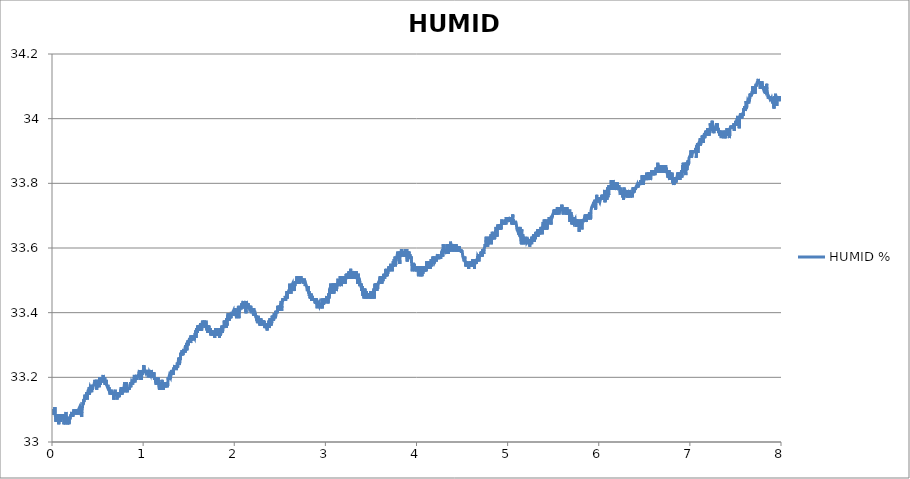
| Category | HUMID % |
|---|---|
| 0.0009014404444444445 | 33.085 |
| 0.003960782083333334 | 33.101 |
| 0.007023179472222222 | 33.085 |
| 0.010082798916666667 | 33.085 |
| 0.013142973944444445 | 33.093 |
| 0.01620231561111111 | 33.101 |
| 0.019261657249999998 | 33.085 |
| 0.0223215545 | 33.101 |
| 0.02538089613888889 | 33.101 |
| 0.028439959999999997 | 33.085 |
| 0.03149930166666667 | 33.108 |
| 0.034559754472222225 | 33.085 |
| 0.037619373916666664 | 33.078 |
| 0.04067871558333333 | 33.085 |
| 0.043738057222222224 | 33.062 |
| 0.04679739888888889 | 33.078 |
| 0.04985701833333333 | 33.085 |
| 0.05291635997222222 | 33.085 |
| 0.05597597941666666 | 33.085 |
| 0.059035598861111115 | 33.078 |
| 0.06209466272222222 | 33.085 |
| 0.06515567113888888 | 33.078 |
| 0.06821584616666666 | 33.078 |
| 0.07127518780555556 | 33.085 |
| 0.07433480725 | 33.055 |
| 0.07739414891666667 | 33.085 |
| 0.08045321277777778 | 33.07 |
| 0.08351311 | 33.062 |
| 0.0865721738611111 | 33.07 |
| 0.08963151552777779 | 33.085 |
| 0.09269085716666665 | 33.078 |
| 0.09575158777777777 | 33.062 |
| 0.09881092944444443 | 33.085 |
| 0.10187082666666668 | 33.07 |
| 0.10492989052777778 | 33.078 |
| 0.10798923219444444 | 33.078 |
| 0.11104829602777777 | 33.078 |
| 0.11410763769444444 | 33.085 |
| 0.11716697933333332 | 33.078 |
| 0.12022604319444445 | 33.085 |
| 0.12328566263888889 | 33.078 |
| 0.12634500430555556 | 33.078 |
| 0.12940406816666666 | 33.085 |
| 0.132463132 | 33.055 |
| 0.13552330705555557 | 33.078 |
| 0.1385829265 | 33.078 |
| 0.1416422681388889 | 33.07 |
| 0.14470188758333333 | 33.062 |
| 0.14776122922222223 | 33.055 |
| 0.1508205708888889 | 33.078 |
| 0.15388019033333333 | 33.093 |
| 0.15693925419444443 | 33.07 |
| 0.15999859583333334 | 33.07 |
| 0.1630579375 | 33.078 |
| 0.16611700133333332 | 33.078 |
| 0.169176343 | 33.055 |
| 0.1722356846388889 | 33.062 |
| 0.17529530408333333 | 33.07 |
| 0.17835520133333335 | 33.062 |
| 0.18141454297222223 | 33.07 |
| 0.18447360683333333 | 33.062 |
| 0.1875368376111111 | 33.055 |
| 0.1905967348333333 | 33.078 |
| 0.19365718766666667 | 33.078 |
| 0.1967176405 | 33.07 |
| 0.1997792045 | 33.078 |
| 0.20284049069444443 | 33.078 |
| 0.2059014991111111 | 33.078 |
| 0.20896084075000002 | 33.085 |
| 0.21202101580555555 | 33.078 |
| 0.21508202419444444 | 33.093 |
| 0.21814247702777778 | 33.085 |
| 0.22120209647222222 | 33.078 |
| 0.22426393827777777 | 33.093 |
| 0.2273235577222222 | 33.078 |
| 0.23038428833333333 | 33.078 |
| 0.2334444633611111 | 33.078 |
| 0.23650630516666665 | 33.093 |
| 0.2395675913611111 | 33.101 |
| 0.24262915536111113 | 33.085 |
| 0.24568877480555557 | 33.093 |
| 0.24874811647222222 | 33.093 |
| 0.2518074581111111 | 33.101 |
| 0.25486791094444444 | 33.101 |
| 0.2579280859722222 | 33.085 |
| 0.2609913167222222 | 33.085 |
| 0.2640520473611111 | 33.093 |
| 0.26711722266666665 | 33.101 |
| 0.2701776755 | 33.093 |
| 0.2732603518055556 | 33.101 |
| 0.2763194156666667 | 33.085 |
| 0.2793798685 | 33.101 |
| 0.2824392101388889 | 33.101 |
| 0.28549882958333334 | 33.093 |
| 0.28855817125 | 33.085 |
| 0.29161751288888893 | 33.101 |
| 0.29467685455555553 | 33.101 |
| 0.29773619619444447 | 33.101 |
| 0.30079553786111113 | 33.101 |
| 0.30385515730555557 | 33.108 |
| 0.30691449894444445 | 33.101 |
| 0.3099752295555555 | 33.101 |
| 0.313034849 | 33.085 |
| 0.31609419066666666 | 33.093 |
| 0.31915325452777776 | 33.085 |
| 0.32221315175 | 33.085 |
| 0.32527582694444446 | 33.078 |
| 0.3283354463888889 | 33.093 |
| 0.3313945102222222 | 33.093 |
| 0.3344538518888889 | 33.108 |
| 0.33751486030555555 | 33.108 |
| 0.34057447975000005 | 33.124 |
| 0.34363382138888887 | 33.116 |
| 0.3466942742222222 | 33.131 |
| 0.3497558382222222 | 33.124 |
| 0.3528149020833333 | 33.131 |
| 0.3558742437222222 | 33.131 |
| 0.3589335853888889 | 33.139 |
| 0.3619934826111111 | 33.146 |
| 0.3650531020555556 | 33.131 |
| 0.3681121659166666 | 33.131 |
| 0.3711720631666667 | 33.139 |
| 0.37423612730555555 | 33.139 |
| 0.37729519116666665 | 33.146 |
| 0.38035508838888893 | 33.154 |
| 0.3834147078333333 | 33.146 |
| 0.38647488286111115 | 33.131 |
| 0.38953478011111115 | 33.146 |
| 0.39259439955555553 | 33.154 |
| 0.39565374119444446 | 33.154 |
| 0.3987130828611111 | 33.162 |
| 0.4017721467222222 | 33.154 |
| 0.4048314883611111 | 33.162 |
| 0.40789110780555554 | 33.169 |
| 0.4109504494722222 | 33.146 |
| 0.4140103466944445 | 33.154 |
| 0.4170694105555555 | 33.162 |
| 0.42012875222222223 | 33.169 |
| 0.4231883716666667 | 33.169 |
| 0.42624771330555555 | 33.169 |
| 0.4293081661388889 | 33.169 |
| 0.43236778558333333 | 33.162 |
| 0.43542740502777777 | 33.154 |
| 0.43848730225 | 33.169 |
| 0.4415466439166667 | 33.177 |
| 0.4446059855555556 | 33.162 |
| 0.44766532722222224 | 33.169 |
| 0.4507246688611111 | 33.169 |
| 0.4537840105 | 33.169 |
| 0.4568433521666667 | 33.169 |
| 0.45990324941666666 | 33.177 |
| 0.46296231325000003 | 33.177 |
| 0.46602304388888893 | 33.177 |
| 0.46908544124999996 | 33.177 |
| 0.47214506069444445 | 33.192 |
| 0.4752069025 | 33.192 |
| 0.47826652194444447 | 33.177 |
| 0.48132641919444447 | 33.185 |
| 0.48438576083333335 | 33.192 |
| 0.4874503805555555 | 33.169 |
| 0.4905097222222222 | 33.162 |
| 0.49357323077777776 | 33.185 |
| 0.49663423919444444 | 33.169 |
| 0.4996944142222222 | 33.185 |
| 0.5027543114444445 | 33.185 |
| 0.5058358766111111 | 33.177 |
| 0.50889994075 | 33.192 |
| 0.5119620603333334 | 33.192 |
| 0.5150222353611111 | 33.185 |
| 0.518081577 | 33.169 |
| 0.5211445299722222 | 33.2 |
| 0.5242149833888889 | 33.185 |
| 0.5272784919444444 | 33.185 |
| 0.5303408893055556 | 33.177 |
| 0.53340050875 | 33.177 |
| 0.5364606838055556 | 33.192 |
| 0.5395200254444444 | 33.185 |
| 0.5425793670833333 | 33.192 |
| 0.5456384309444444 | 33.192 |
| 0.5486983281944444 | 33.2 |
| 0.5517590588055555 | 33.2 |
| 0.5548203450277778 | 33.185 |
| 0.5578799644722222 | 33.2 |
| 0.5609398616944444 | 33.207 |
| 0.56400337025 | 33.192 |
| 0.5670652120555556 | 33.192 |
| 0.5701248315 | 33.185 |
| 0.5731861176944445 | 33.185 |
| 0.5762535153611111 | 33.192 |
| 0.579318412888889 | 33.2 |
| 0.5823780323333334 | 33.177 |
| 0.5854382073611112 | 33.185 |
| 0.5884981046111111 | 33.185 |
| 0.5915630021388889 | 33.177 |
| 0.5946242883333334 | 33.192 |
| 0.5976839077777778 | 33.177 |
| 0.6007438050277777 | 33.177 |
| 0.6038053690277777 | 33.177 |
| 0.6068669330277777 | 33.177 |
| 0.6099287748055556 | 33.169 |
| 0.6129889498611111 | 33.177 |
| 0.6160510694444444 | 33.169 |
| 0.6191159669722222 | 33.162 |
| 0.6221755864166667 | 33.162 |
| 0.62523465025 | 33.169 |
| 0.6282978810277777 | 33.169 |
| 0.6313580560555556 | 33.154 |
| 0.6344176755 | 33.154 |
| 0.6374772949444445 | 33.146 |
| 0.6405388589444444 | 33.146 |
| 0.6435987561944445 | 33.154 |
| 0.6466630981111111 | 33.162 |
| 0.6497257733055556 | 33.162 |
| 0.652786226111111 | 33.162 |
| 0.6558483457222222 | 33.154 |
| 0.6589090763333334 | 33.146 |
| 0.6619686957777777 | 33.146 |
| 0.6650305375555556 | 33.146 |
| 0.6680926571666667 | 33.154 |
| 0.671153943361111 | 33.146 |
| 0.6742143961944443 | 33.154 |
| 0.6772748490277777 | 33.131 |
| 0.6803408577222222 | 33.146 |
| 0.6834035328888889 | 33.146 |
| 0.6864650968888889 | 33.146 |
| 0.6895272164722223 | 33.146 |
| 0.6925868359166667 | 33.162 |
| 0.69564728875 | 33.154 |
| 0.698708019361111 | 33.146 |
| 0.7017695833611111 | 33.146 |
| 0.7048294806111112 | 33.146 |
| 0.70788882225 | 33.146 |
| 0.7109506640555556 | 33.146 |
| 0.7140100056944444 | 33.131 |
| 0.7170693473611112 | 33.146 |
| 0.7201292445833334 | 33.154 |
| 0.7231891418333333 | 33.139 |
| 0.7262487612777777 | 33.146 |
| 0.7293081029166667 | 33.139 |
| 0.7323674445833334 | 33.146 |
| 0.735427619611111 | 33.154 |
| 0.7384872390555556 | 33.139 |
| 0.7415490808333334 | 33.154 |
| 0.7446092558888889 | 33.154 |
| 0.7476683197222223 | 33.146 |
| 0.7507276613888889 | 33.154 |
| 0.7537872808333334 | 33.162 |
| 0.7568477336666667 | 33.154 |
| 0.7599104088333334 | 33.169 |
| 0.7629725284166666 | 33.154 |
| 0.7660352035833333 | 33.162 |
| 0.7690948230277778 | 33.146 |
| 0.7721549980833333 | 33.169 |
| 0.77521767325 | 33.154 |
| 0.778278403861111 | 33.162 |
| 0.7813383011111111 | 33.154 |
| 0.7843979205555556 | 33.154 |
| 0.7874619846944444 | 33.162 |
| 0.7905229931111112 | 33.169 |
| 0.79358233475 | 33.169 |
| 0.796642232 | 33.185 |
| 0.7997015736388889 | 33.162 |
| 0.80276230425 | 33.154 |
| 0.8058224793055556 | 33.154 |
| 0.8088851544722223 | 33.154 |
| 0.8119500519999999 | 33.162 |
| 0.8150093936388888 | 33.162 |
| 0.8180726244166667 | 33.185 |
| 0.8211352995833334 | 33.162 |
| 0.8241960301944444 | 33.169 |
| 0.8272562052222222 | 33.154 |
| 0.8303169358611111 | 33.162 |
| 0.8333787776388889 | 33.162 |
| 0.8364389526666667 | 33.169 |
| 0.8395002388888889 | 33.162 |
| 0.8425623584722222 | 33.162 |
| 0.845629478361111 | 33.169 |
| 0.8486899311666667 | 33.162 |
| 0.8517506618055556 | 33.169 |
| 0.8548116701944445 | 33.169 |
| 0.8578721230277777 | 33.169 |
| 0.8609361871666668 | 33.185 |
| 0.8639971955833333 | 33.169 |
| 0.8670573706111111 | 33.185 |
| 0.8701172678611111 | 33.177 |
| 0.8731793874444445 | 33.185 |
| 0.8762426182222223 | 33.185 |
| 0.8793025154444445 | 33.185 |
| 0.8823621348888889 | 33.185 |
| 0.8854234211111112 | 33.177 |
| 0.8884847073055555 | 33.192 |
| 0.8915448823333333 | 33.185 |
| 0.8946086686944444 | 33.192 |
| 0.8976716216666667 | 33.185 |
| 0.9007323522777777 | 33.2 |
| 0.903792805111111 | 33.207 |
| 0.9068554802777777 | 33.2 |
| 0.9099159331111111 | 33.185 |
| 0.9129813862222221 | 33.192 |
| 0.9160410056666667 | 33.2 |
| 0.9191053475833333 | 33.2 |
| 0.9221644114444444 | 33.2 |
| 0.9252254198611112 | 33.207 |
| 0.9282875394444444 | 33.207 |
| 0.9313468811111111 | 33.192 |
| 0.93440622275 | 33.2 |
| 0.9374661200000001 | 33.207 |
| 0.9405329620833334 | 33.207 |
| 0.9435923037222222 | 33.207 |
| 0.9466519231666666 | 33.2 |
| 0.9497129315833334 | 33.207 |
| 0.9527725510277778 | 33.215 |
| 0.9558330038611111 | 33.215 |
| 0.9588931788888889 | 33.223 |
| 0.9619536317222223 | 33.207 |
| 0.9650154734999999 | 33.207 |
| 0.9680750929444445 | 33.215 |
| 0.971134434611111 | 33.207 |
| 0.9741976653611111 | 33.192 |
| 0.9772586737777778 | 33.207 |
| 0.9803205155555555 | 33.192 |
| 0.9833823573611111 | 33.2 |
| 0.9864422546111111 | 33.215 |
| 0.989503818611111 | 33.207 |
| 0.9925651048055555 | 33.223 |
| 0.9956258354166666 | 33.215 |
| 0.9986851770833333 | 33.215 |
| 1.0017445187222223 | 33.223 |
| 1.0048041381666666 | 33.215 |
| 1.0078690356944444 | 33.238 |
| 1.0109311552777778 | 33.215 |
| 1.013991608111111 | 33.223 |
| 1.0170551166666666 | 33.223 |
| 1.0201155695 | 33.223 |
| 1.0231749111388888 | 33.223 |
| 1.0262353639722221 | 33.215 |
| 1.0292988725277779 | 33.223 |
| 1.0323601587222222 | 33.223 |
| 1.0354211671388889 | 33.215 |
| 1.038480231 | 33.223 |
| 1.0415395726666667 | 33.215 |
| 1.0446022478333334 | 33.223 |
| 1.0476668675555556 | 33.215 |
| 1.0507292649444444 | 33.207 |
| 1.0537894399722223 | 33.215 |
| 1.0568543375000001 | 33.223 |
| 1.0599150681111111 | 33.223 |
| 1.062986354888889 | 33.2 |
| 1.066047918888889 | 33.2 |
| 1.0691089273055554 | 33.215 |
| 1.07216854675 | 33.215 |
| 1.07523011075 | 33.215 |
| 1.0782894524166666 | 33.215 |
| 1.0813526831666667 | 33.207 |
| 1.0844161917222221 | 33.215 |
| 1.08747636675 | 33.215 |
| 1.090536264 | 33.223 |
| 1.093597828 | 33.215 |
| 1.0966588364166667 | 33.215 |
| 1.0997215115833332 | 33.215 |
| 1.1027819644166665 | 33.2 |
| 1.1058454729722222 | 33.2 |
| 1.1089062035833332 | 33.215 |
| 1.111968045388889 | 33.207 |
| 1.1150346096666668 | 33.2 |
| 1.1180945068888888 | 33.215 |
| 1.12115357075 | 33.2 |
| 1.1242181905 | 33.192 |
| 1.127277532138889 | 33.192 |
| 1.1303385405555555 | 33.192 |
| 1.1334020491111112 | 33.2 |
| 1.13646139075 | 33.185 |
| 1.1395285106388888 | 33.185 |
| 1.1425897968333334 | 33.177 |
| 1.1456519164166667 | 33.177 |
| 1.148711535861111 | 33.185 |
| 1.1517733776666668 | 33.192 |
| 1.1548354972500001 | 33.185 |
| 1.1578948389166668 | 33.185 |
| 1.160954458361111 | 33.185 |
| 1.1640140778055554 | 33.2 |
| 1.1670767529722221 | 33.2 |
| 1.1701363724166665 | 33.185 |
| 1.1731987698055557 | 33.169 |
| 1.1762589448333334 | 33.169 |
| 1.1793213422222222 | 33.162 |
| 1.1823812394444444 | 33.177 |
| 1.1854436368333334 | 33.169 |
| 1.1885040896666668 | 33.169 |
| 1.1915650980555557 | 33.162 |
| 1.1946291622222223 | 33.185 |
| 1.197691004 | 33.162 |
| 1.2007536791666666 | 33.177 |
| 1.2038191322777778 | 33.169 |
| 1.2068795851111112 | 33.192 |
| 1.2099419825 | 33.185 |
| 1.2130027131111112 | 33.162 |
| 1.2160642771111112 | 33.185 |
| 1.2191252855277779 | 33.169 |
| 1.2221901830555557 | 33.162 |
| 1.2252498025 | 33.162 |
| 1.2283138666388889 | 33.177 |
| 1.2313765418055556 | 33.185 |
| 1.2344406059722224 | 33.177 |
| 1.2375168930277778 | 33.169 |
| 1.240577623638889 | 33.177 |
| 1.2436372430833333 | 33.177 |
| 1.2466979737222221 | 33.185 |
| 1.2497628712222222 | 33.185 |
| 1.2528236018611112 | 33.169 |
| 1.2559004445 | 33.185 |
| 1.2589622863055554 | 33.185 |
| 1.2620213501666666 | 33.185 |
| 1.265085969888889 | 33.177 |
| 1.2681458671388888 | 33.169 |
| 1.271207431138889 | 33.185 |
| 1.2742951077222222 | 33.2 |
| 1.2773569495277777 | 33.192 |
| 1.28041684675 | 33.192 |
| 1.283477577388889 | 33.2 |
| 1.2865380301944445 | 33.2 |
| 1.2895995942222223 | 33.207 |
| 1.292662824972222 | 33.207 |
| 1.2957221666111112 | 33.207 |
| 1.2987826194444445 | 33.207 |
| 1.3018480725555555 | 33.2 |
| 1.304907692 | 33.2 |
| 1.3079703671666667 | 33.2 |
| 1.3110294310277777 | 33.215 |
| 1.3140896060555556 | 33.223 |
| 1.3171525590277777 | 33.207 |
| 1.3202119006944446 | 33.223 |
| 1.3232717979166666 | 33.215 |
| 1.32633225075 | 33.223 |
| 1.3293927035833333 | 33.207 |
| 1.3324534341944445 | 33.215 |
| 1.3355133314444445 | 33.23 |
| 1.3385751732222222 | 33.223 |
| 1.3416347926666667 | 33.223 |
| 1.3446955233055558 | 33.223 |
| 1.3477779218055554 | 33.238 |
| 1.3508389302222223 | 33.223 |
| 1.3539027165833333 | 33.223 |
| 1.356967891888889 | 33.23 |
| 1.3600344561944444 | 33.238 |
| 1.3630943534166666 | 33.223 |
| 1.3661567508055554 | 33.223 |
| 1.3692172036388888 | 33.23 |
| 1.372277100861111 | 33.238 |
| 1.3753433873611112 | 33.246 |
| 1.3784038401944445 | 33.23 |
| 1.38146734875 | 33.238 |
| 1.3845283571666667 | 33.246 |
| 1.3875882543888889 | 33.253 |
| 1.3906481516388887 | 33.261 |
| 1.3937077710833334 | 33.238 |
| 1.3967710018333332 | 33.253 |
| 1.3998325658333333 | 33.238 |
| 1.4028927408611112 | 33.261 |
| 1.405954304861111 | 33.253 |
| 1.4090161466666666 | 33.261 |
| 1.4120765995 | 33.276 |
| 1.4151448305277778 | 33.268 |
| 1.4182041721944445 | 33.268 |
| 1.42127240325 | 33.276 |
| 1.4243361895833333 | 33.276 |
| 1.4273988647777778 | 33.284 |
| 1.4304607065555555 | 33.268 |
| 1.4335419939166667 | 33.276 |
| 1.436603280111111 | 33.268 |
| 1.4396681776388889 | 33.268 |
| 1.442727519277778 | 33.284 |
| 1.4457876943333334 | 33.284 |
| 1.4488484249444447 | 33.284 |
| 1.4519102667500001 | 33.284 |
| 1.4549712751388888 | 33.284 |
| 1.4580356170833335 | 33.284 |
| 1.4610980144722223 | 33.276 |
| 1.4641587450833335 | 33.299 |
| 1.4672205868888888 | 33.284 |
| 1.4702821508888888 | 33.284 |
| 1.4733417703333334 | 33.291 |
| 1.4764033343333334 | 33.307 |
| 1.479462953777778 | 33.284 |
| 1.4825234065833333 | 33.291 |
| 1.485584970611111 | 33.299 |
| 1.4886551461944444 | 33.299 |
| 1.491714765638889 | 33.314 |
| 1.494774662888889 | 33.299 |
| 1.4978348379166666 | 33.314 |
| 1.5008950129444445 | 33.307 |
| 1.5039549101944443 | 33.314 |
| 1.5070253635833335 | 33.314 |
| 1.5101135957777778 | 33.322 |
| 1.5131734930277778 | 33.307 |
| 1.5162328346666667 | 33.307 |
| 1.5192921763055556 | 33.314 |
| 1.5223548515 | 33.307 |
| 1.5254158599166665 | 33.33 |
| 1.5284779795 | 33.314 |
| 1.5315375989444444 | 33.314 |
| 1.5345972183888887 | 33.314 |
| 1.5376612825277778 | 33.314 |
| 1.5407220131388888 | 33.322 |
| 1.5437852439166666 | 33.33 |
| 1.5468451411388888 | 33.322 |
| 1.549905038388889 | 33.314 |
| 1.5529652134166667 | 33.33 |
| 1.5560270552222222 | 33.33 |
| 1.5590861190555556 | 33.33 |
| 1.5621460163055556 | 33.33 |
| 1.5652061913333333 | 33.322 |
| 1.5682691443055556 | 33.33 |
| 1.571330986111111 | 33.337 |
| 1.5743953280277778 | 33.322 |
| 1.5774546696944445 | 33.345 |
| 1.5805176226666668 | 33.322 |
| 1.5835786310833333 | 33.345 |
| 1.58664130625 | 33.352 |
| 1.5897014812777777 | 33.337 |
| 1.592761934111111 | 33.352 |
| 1.5958271094166667 | 33.337 |
| 1.5988897845833334 | 33.36 |
| 1.6019502374166668 | 33.345 |
| 1.6050126348055556 | 33.36 |
| 1.6080775323333334 | 33.345 |
| 1.6111452077777777 | 33.345 |
| 1.6142062161944444 | 33.352 |
| 1.6172655578611113 | 33.352 |
| 1.6203268440555556 | 33.352 |
| 1.6233867413055554 | 33.352 |
| 1.6264460829444445 | 33.36 |
| 1.6295065357777778 | 33.368 |
| 1.6325661552222221 | 33.345 |
| 1.6356304971666666 | 33.352 |
| 1.6386928945277777 | 33.352 |
| 1.6417594588333335 | 33.345 |
| 1.6448243563333333 | 33.352 |
| 1.6478839758055557 | 33.352 |
| 1.6509441508333333 | 33.375 |
| 1.6540037702777777 | 33.36 |
| 1.657065889861111 | 33.36 |
| 1.660135509861111 | 33.36 |
| 1.6631951293055556 | 33.368 |
| 1.6662608602222222 | 33.36 |
| 1.6693207574722222 | 33.375 |
| 1.6723814880833334 | 33.368 |
| 1.6754458300277777 | 33.368 |
| 1.67851044975 | 33.352 |
| 1.6815697913888887 | 33.36 |
| 1.6846302442222223 | 33.36 |
| 1.687689585888889 | 33.36 |
| 1.6907672619166667 | 33.375 |
| 1.6938313260555555 | 33.352 |
| 1.6968909455 | 33.36 |
| 1.699950009361111 | 33.345 |
| 1.7030107399722223 | 33.36 |
| 1.706070637222222 | 33.36 |
| 1.7091327568055554 | 33.337 |
| 1.7121926540277779 | 33.36 |
| 1.7152592183333333 | 33.352 |
| 1.7183199489444445 | 33.352 |
| 1.7213815129444445 | 33.36 |
| 1.7244430769444443 | 33.352 |
| 1.7275024185833334 | 33.352 |
| 1.7305617602499999 | 33.352 |
| 1.7336213796944444 | 33.345 |
| 1.7366859994166668 | 33.352 |
| 1.7397456188611111 | 33.337 |
| 1.7428063494722221 | 33.33 |
| 1.7458659689166667 | 33.345 |
| 1.7489272551388888 | 33.337 |
| 1.75198798575 | 33.337 |
| 1.755047883 | 33.345 |
| 1.7581091691944446 | 33.33 |
| 1.761168510861111 | 33.337 |
| 1.7642289636666666 | 33.337 |
| 1.7672888609166666 | 33.337 |
| 1.7703543140277778 | 33.345 |
| 1.7734136556666666 | 33.337 |
| 1.7764741085 | 33.337 |
| 1.7795367836666667 | 33.337 |
| 1.7825966809166667 | 33.33 |
| 1.7856621340277776 | 33.322 |
| 1.788732309638889 | 33.337 |
| 1.7917941514166666 | 33.33 |
| 1.7948587711666666 | 33.352 |
| 1.797921724138889 | 33.33 |
| 1.8009835659166666 | 33.337 |
| 1.804043185361111 | 33.337 |
| 1.8071036381944443 | 33.33 |
| 1.810167980138889 | 33.352 |
| 1.8132281551666667 | 33.345 |
| 1.8162922193055555 | 33.33 |
| 1.8193518387499998 | 33.33 |
| 1.8224142361388889 | 33.337 |
| 1.8254744111666665 | 33.337 |
| 1.8285354195833332 | 33.337 |
| 1.831596428 | 33.337 |
| 1.8346591031666668 | 33.337 |
| 1.8377203893611112 | 33.322 |
| 1.8407825089444443 | 33.345 |
| 1.843842128388889 | 33.337 |
| 1.8469100816666666 | 33.352 |
| 1.8499697011111111 | 33.33 |
| 1.8530320984722224 | 33.345 |
| 1.8560922735277778 | 33.337 |
| 1.85915217075 | 33.352 |
| 1.8622123457777777 | 33.352 |
| 1.8652747431666665 | 33.36 |
| 1.868336029361111 | 33.345 |
| 1.8714037048333332 | 33.337 |
| 1.87446471325 | 33.352 |
| 1.8775243326944444 | 33.36 |
| 1.8805842299166668 | 33.36 |
| 1.8836444049722223 | 33.352 |
| 1.886703746611111 | 33.36 |
| 1.8897650328055555 | 33.375 |
| 1.8928393753333332 | 33.368 |
| 1.8959012171111111 | 33.375 |
| 1.8989611143611111 | 33.375 |
| 1.9020224005555555 | 33.375 |
| 1.9050831311944443 | 33.375 |
| 1.9081455285555555 | 33.36 |
| 1.9112098704999998 | 33.375 |
| 1.914268934361111 | 33.352 |
| 1.9173382765833333 | 33.383 |
| 1.9203976182222222 | 33.36 |
| 1.9234569598888889 | 33.368 |
| 1.9265168571388889 | 33.391 |
| 1.9295770321666665 | 33.391 |
| 1.93263915175 | 33.398 |
| 1.9357034936944446 | 33.383 |
| 1.9387642243055554 | 33.383 |
| 1.9418246771388887 | 33.383 |
| 1.9448842965833335 | 33.383 |
| 1.9479461383611112 | 33.375 |
| 1.9510071467777779 | 33.398 |
| 1.9540695441666667 | 33.383 |
| 1.9571322193333334 | 33.391 |
| 1.9601932277499998 | 33.398 |
| 1.9632561807222222 | 33.383 |
| 1.9663158001666667 | 33.398 |
| 1.969375419611111 | 33.398 |
| 1.9724361502222223 | 33.398 |
| 1.9755060480277777 | 33.398 |
| 1.9785670564444444 | 33.398 |
| 1.981632787361111 | 33.398 |
| 1.984692129 | 33.398 |
| 1.987778138861111 | 33.398 |
| 1.9908410918055557 | 33.406 |
| 1.99390543375 | 33.398 |
| 1.996967831138889 | 33.391 |
| 2.0000391179166668 | 33.398 |
| 2.003100126333333 | 33.406 |
| 2.0061655794444446 | 33.391 |
| 2.0092260322777777 | 33.413 |
| 2.012285373916667 | 33.406 |
| 2.0153494380555554 | 33.398 |
| 2.0184121132222224 | 33.406 |
| 2.0214772885555554 | 33.391 |
| 2.024551353277778 | 33.383 |
| 2.027610694916667 | 33.406 |
| 2.0306705921666666 | 33.406 |
| 2.0337324339444445 | 33.391 |
| 2.036796498083333 | 33.398 |
| 2.0398583398888888 | 33.406 |
| 2.0429182371388888 | 33.413 |
| 2.0459778565833333 | 33.421 |
| 2.049037476027778 | 33.398 |
| 2.052096539861111 | 33.383 |
| 2.0551581038611113 | 33.413 |
| 2.058221612416667 | 33.406 |
| 2.0612845653888887 | 33.406 |
| 2.0643450182222223 | 33.413 |
| 2.0674046376666664 | 33.413 |
| 2.070464534916667 | 33.413 |
| 2.073526932277778 | 33.413 |
| 2.076586829527778 | 33.413 |
| 2.0796483935277776 | 33.429 |
| 2.082708012972222 | 33.413 |
| 2.0857687435833334 | 33.413 |
| 2.088830585388889 | 33.421 |
| 2.0918952051111113 | 33.413 |
| 2.0949556579444444 | 33.413 |
| 2.098015832972222 | 33.436 |
| 2.101076008 | 33.421 |
| 2.1041364608333333 | 33.421 |
| 2.107197747027778 | 33.421 |
| 2.1102618111666667 | 33.429 |
| 2.1133217084166667 | 33.421 |
| 2.116382439027778 | 33.421 |
| 2.1194476143611114 | 33.413 |
| 2.122510845111111 | 33.413 |
| 2.1255707423611114 | 33.421 |
| 2.128630639583333 | 33.398 |
| 2.1316910924166668 | 33.421 |
| 2.134754323194444 | 33.436 |
| 2.1378161649722225 | 33.421 |
| 2.140891340861111 | 33.421 |
| 2.143952904861111 | 33.429 |
| 2.1470136355 | 33.421 |
| 2.1500738105277777 | 33.413 |
| 2.1531362078888887 | 33.429 |
| 2.1561997164444446 | 33.413 |
| 2.159259058111111 | 33.421 |
| 2.1623211776944444 | 33.421 |
| 2.165380797138889 | 33.413 |
| 2.168440694388889 | 33.413 |
| 2.171500313833333 | 33.413 |
| 2.174566322527778 | 33.421 |
| 2.1776345535555555 | 33.413 |
| 2.180694173027778 | 33.421 |
| 2.1837543480555555 | 33.413 |
| 2.1868145230833336 | 33.413 |
| 2.189876364861111 | 33.398 |
| 2.1929357065277775 | 33.398 |
| 2.195994770388889 | 33.413 |
| 2.1990557788055556 | 33.413 |
| 2.202122065277778 | 33.406 |
| 2.205185851638889 | 33.406 |
| 2.2082549160555556 | 33.398 |
| 2.2113162022777777 | 33.391 |
| 2.2143777662777775 | 33.413 |
| 2.2174398858611113 | 33.398 |
| 2.220501449861111 | 33.398 |
| 2.2235610693055556 | 33.406 |
| 2.2266315226944444 | 33.391 |
| 2.2296936422777778 | 33.398 |
| 2.2327535395277778 | 33.391 |
| 2.2358131589722223 | 33.391 |
| 2.2388722228333333 | 33.391 |
| 2.2419321200555555 | 33.383 |
| 2.245003406861111 | 33.391 |
| 2.2480641374722223 | 33.375 |
| 2.2511262570555557 | 33.383 |
| 2.2541872654722224 | 33.368 |
| 2.2572485516666667 | 33.383 |
| 2.2603081711111113 | 33.383 |
| 2.2633711240833336 | 33.391 |
| 2.2664324103055553 | 33.391 |
| 2.2694920297500003 | 33.368 |
| 2.272554149333333 | 33.375 |
| 2.2756151577500003 | 33.375 |
| 2.2786772773333333 | 33.383 |
| 2.281743841611111 | 33.36 |
| 2.284804294444444 | 33.383 |
| 2.2878683585833333 | 33.36 |
| 2.2909993710000003 | 33.383 |
| 2.2940617683888886 | 33.375 |
| 2.2971222211944444 | 33.368 |
| 2.3001821184444444 | 33.375 |
| 2.3032453491944445 | 33.36 |
| 2.3063083021666664 | 33.375 |
| 2.309372366305556 | 33.368 |
| 2.3124325413611113 | 33.375 |
| 2.3154943831388892 | 33.368 |
| 2.318555113777778 | 33.375 |
| 2.3216177889444443 | 33.368 |
| 2.324679908527778 | 33.368 |
| 2.327741472527778 | 33.375 |
| 2.33080609225 | 33.36 |
| 2.3338696008055555 | 33.352 |
| 2.3369286646666665 | 33.352 |
| 2.3399896730833336 | 33.352 |
| 2.343052070472222 | 33.36 |
| 2.3461122455 | 33.352 |
| 2.349174642888889 | 33.368 |
| 2.3522350956944447 | 33.36 |
| 2.355294437361111 | 33.36 |
| 2.3583540568055557 | 33.36 |
| 2.3614150652222223 | 33.345 |
| 2.364474406861111 | 33.36 |
| 2.367534304111111 | 33.36 |
| 2.3705978126666665 | 33.36 |
| 2.373657432111111 | 33.36 |
| 2.376725385361111 | 33.36 |
| 2.3797897273055555 | 33.375 |
| 2.382854069222222 | 33.352 |
| 2.3859145220555558 | 33.368 |
| 2.3889744193055553 | 33.368 |
| 2.3920526509166664 | 33.383 |
| 2.3951256044444444 | 33.36 |
| 2.398185223888889 | 33.368 |
| 2.4012484546666664 | 33.375 |
| 2.4043114076388887 | 33.36 |
| 2.4073724160555554 | 33.375 |
| 2.410434535638889 | 33.368 |
| 2.4134972108055557 | 33.383 |
| 2.4165571080555557 | 33.391 |
| 2.4196172830833333 | 33.383 |
| 2.42268468075 | 33.383 |
| 2.425744022388889 | 33.383 |
| 2.428805030805556 | 33.391 |
| 2.4318643724722224 | 33.375 |
| 2.4349237141111115 | 33.391 |
| 2.4379858336944444 | 33.398 |
| 2.441080455138889 | 33.398 |
| 2.4441411857777777 | 33.391 |
| 2.4472069166666666 | 33.391 |
| 2.4502670916944442 | 33.398 |
| 2.4533328226111113 | 33.383 |
| 2.456394386611111 | 33.406 |
| 2.4594551172222223 | 33.398 |
| 2.4625164034444444 | 33.398 |
| 2.465579078611111 | 33.398 |
| 2.468639531444444 | 33.398 |
| 2.471699706472222 | 33.406 |
| 2.474760714888889 | 33.398 |
| 2.47781977875 | 33.421 |
| 2.4808824539166667 | 33.413 |
| 2.4839426289444444 | 33.413 |
| 2.4870030817777775 | 33.406 |
| 2.4900638123888887 | 33.421 |
| 2.493125376388889 | 33.421 |
| 2.496185829222222 | 33.406 |
| 2.499245170861111 | 33.421 |
| 2.502305068111111 | 33.421 |
| 2.5053696878333334 | 33.421 |
| 2.508434029777778 | 33.413 |
| 2.5114961493611108 | 33.429 |
| 2.514556324388889 | 33.436 |
| 2.5176176106111114 | 33.421 |
| 2.520678619 | 33.406 |
| 2.523744627722222 | 33.421 |
| 2.526805358333333 | 33.421 |
| 2.5298680335 | 33.421 |
| 2.532930430888889 | 33.444 |
| 2.535990883722222 | 33.436 |
| 2.5390516143333333 | 33.444 |
| 2.542113456138889 | 33.436 |
| 2.5451741867499997 | 33.444 |
| 2.548234917361111 | 33.444 |
| 2.5512987037222223 | 33.444 |
| 2.5543594343333336 | 33.436 |
| 2.557419331583333 | 33.444 |
| 2.5604795066111112 | 33.452 |
| 2.5635388482500003 | 33.436 |
| 2.5665987455 | 33.444 |
| 2.569661420666667 | 33.444 |
| 2.5727254848055554 | 33.444 |
| 2.5757853820555554 | 33.459 |
| 2.578853890888889 | 33.467 |
| 2.5819146215 | 33.444 |
| 2.5849761855000004 | 33.459 |
| 2.5880358049444445 | 33.459 |
| 2.59109598 | 33.459 |
| 2.5941561550277776 | 33.459 |
| 2.5972185523888887 | 33.467 |
| 2.600279838611111 | 33.459 |
| 2.6033402914444443 | 33.467 |
| 2.6064029666111113 | 33.467 |
| 2.6094628638333335 | 33.49 |
| 2.6125394286944443 | 33.467 |
| 2.61560765975 | 33.467 |
| 2.618672557277778 | 33.482 |
| 2.621734399083333 | 33.459 |
| 2.624794851888889 | 33.467 |
| 2.6278553047222224 | 33.482 |
| 2.6309143685833334 | 33.482 |
| 2.633975099194444 | 33.482 |
| 2.637034718638889 | 33.482 |
| 2.6400968382222225 | 33.49 |
| 2.6431631247222223 | 33.482 |
| 2.646222466388889 | 33.467 |
| 2.6492831970000004 | 33.482 |
| 2.6523430942222226 | 33.49 |
| 2.6554052138333333 | 33.49 |
| 2.6584648332777774 | 33.467 |
| 2.6615288974166664 | 33.49 |
| 2.664593794944444 | 33.482 |
| 2.6676536921666667 | 33.49 |
| 2.6707141450000003 | 33.497 |
| 2.673788765305556 | 33.49 |
| 2.676850884888889 | 33.49 |
| 2.6799163380000004 | 33.49 |
| 2.6829815133055557 | 33.497 |
| 2.6860422439444442 | 33.513 |
| 2.689103530138889 | 33.505 |
| 2.6921642607500003 | 33.49 |
| 2.695235825333333 | 33.505 |
| 2.698299333888889 | 33.505 |
| 2.7013633980277776 | 33.513 |
| 2.704428017777778 | 33.513 |
| 2.707487637222222 | 33.505 |
| 2.71054781225 | 33.513 |
| 2.71360937625 | 33.497 |
| 2.7166689956944445 | 33.505 |
| 2.719728615138889 | 33.49 |
| 2.7227890679444444 | 33.505 |
| 2.7258553544444446 | 33.497 |
| 2.728914696111111 | 33.497 |
| 2.7319745933333333 | 33.513 |
| 2.7350339349999997 | 33.497 |
| 2.7380938322222224 | 33.505 |
| 2.741154285055556 | 33.497 |
| 2.7442172380277774 | 33.505 |
| 2.7472790798055557 | 33.505 |
| 2.7503406438055555 | 33.497 |
| 2.753401374444444 | 33.505 |
| 2.7564634940277775 | 33.505 |
| 2.7595245024444446 | 33.49 |
| 2.7625855108611113 | 33.497 |
| 2.765645685888889 | 33.505 |
| 2.7687050275277776 | 33.505 |
| 2.7717663137499997 | 33.505 |
| 2.7748459343333334 | 33.497 |
| 2.7779058315555556 | 33.482 |
| 2.780974062611111 | 33.482 |
| 2.7840378489722224 | 33.49 |
| 2.7870974684166665 | 33.49 |
| 2.7901584768333336 | 33.49 |
| 2.7932214297777778 | 33.482 |
| 2.796280493638889 | 33.482 |
| 2.7993409464722223 | 33.482 |
| 2.8024011215 | 33.467 |
| 2.8054632410833333 | 33.474 |
| 2.808522860527778 | 33.467 |
| 2.81158886925 | 33.482 |
| 2.8146509888333333 | 33.467 |
| 2.817710608277778 | 33.459 |
| 2.820769672138889 | 33.467 |
| 2.8238304027499996 | 33.452 |
| 2.826890022194444 | 33.459 |
| 2.8299504750277777 | 33.459 |
| 2.8330095388611114 | 33.444 |
| 2.8360708250833335 | 33.452 |
| 2.839135722611111 | 33.444 |
| 2.842198953361111 | 33.452 |
| 2.8452602395833333 | 33.459 |
| 2.848325414888889 | 33.436 |
| 2.851385867722222 | 33.452 |
| 2.8544465983333334 | 33.436 |
| 2.8575064955833334 | 33.452 |
| 2.8605669483888887 | 33.444 |
| 2.8636287901944444 | 33.436 |
| 2.8666900763888887 | 33.444 |
| 2.8697502514444446 | 33.436 |
| 2.872819038083333 | 33.444 |
| 2.8758819910277778 | 33.436 |
| 2.8789416104722223 | 33.436 |
| 2.8820015077222223 | 33.436 |
| 2.885063905111111 | 33.444 |
| 2.8881243579166664 | 33.429 |
| 2.891183699583333 | 33.444 |
| 2.894243319027778 | 33.429 |
| 2.89730321625 | 33.429 |
| 2.900367002611111 | 33.444 |
| 2.903427455444444 | 33.436 |
| 2.906492352972222 | 33.436 |
| 2.9095572505 | 33.413 |
| 2.9126185366944446 | 33.429 |
| 2.915684545388889 | 33.436 |
| 2.9187447204166665 | 33.429 |
| 2.9218060066388887 | 33.421 |
| 2.924878404583333 | 33.421 |
| 2.9279380240277777 | 33.421 |
| 2.93100264375 | 33.429 |
| 2.934066430111111 | 33.429 |
| 2.937129105277778 | 33.421 |
| 2.9401884469444446 | 33.421 |
| 2.9432600115 | 33.421 |
| 2.946319353166667 | 33.429 |
| 2.949380361583333 | 33.421 |
| 2.9524397032222223 | 33.413 |
| 2.9555026561944446 | 33.421 |
| 2.958562553416667 | 33.429 |
| 2.9616235618333335 | 33.444 |
| 2.9646854036388888 | 33.436 |
| 2.967746689833333 | 33.413 |
| 2.9708079760555552 | 33.429 |
| 2.97388676325 | 33.429 |
| 2.976946104916667 | 33.429 |
| 2.9800079466944442 | 33.429 |
| 2.983067288361111 | 33.429 |
| 2.9861285745555555 | 33.436 |
| 2.9891901385555557 | 33.444 |
| 2.992253647111111 | 33.429 |
| 2.9953252116944444 | 33.429 |
| 2.9983867756944442 | 33.429 |
| 3.0014461173333333 | 33.444 |
| 3.0045057367777774 | 33.444 |
| 3.00756868975 | 33.436 |
| 3.01063025375 | 33.444 |
| 3.0136940401111114 | 33.452 |
| 3.0167550485277776 | 33.436 |
| 3.0198152235555558 | 33.444 |
| 3.022879843277778 | 33.436 |
| 3.0259400183055556 | 33.444 |
| 3.029002971277778 | 33.429 |
| 3.03206592425 | 33.444 |
| 3.0351272104444442 | 33.459 |
| 3.0381887744444445 | 33.444 |
| 3.041249505083333 | 33.444 |
| 3.044309957888889 | 33.452 |
| 3.0473773555555557 | 33.474 |
| 3.050436697222222 | 33.467 |
| 3.053500205777778 | 33.467 |
| 3.0565601030000003 | 33.467 |
| 3.05962000025 | 33.49 |
| 3.062684619972222 | 33.459 |
| 3.065747295166666 | 33.467 |
| 3.0688255267777778 | 33.467 |
| 3.071885146222222 | 33.459 |
| 3.0749455990555554 | 33.482 |
| 3.078007718638889 | 33.482 |
| 3.0810701160277776 | 33.482 |
| 3.084139736027778 | 33.49 |
| 3.087205744722222 | 33.467 |
| 3.0902656419722225 | 33.49 |
| 3.0933274837777778 | 33.459 |
| 3.096386825416667 | 33.482 |
| 3.0994458892777774 | 33.467 |
| 3.1025082866666667 | 33.49 |
| 3.105568739472222 | 33.482 |
| 3.108628358916667 | 33.482 |
| 3.1116882561666666 | 33.49 |
| 3.1147492645833337 | 33.49 |
| 3.117811106361111 | 33.482 |
| 3.1208704480277776 | 33.467 |
| 3.1239317342222224 | 33.467 |
| 3.126991631472222 | 33.482 |
| 3.130051528694444 | 33.482 |
| 3.1331122593333336 | 33.49 |
| 3.1361721565555554 | 33.49 |
| 3.1392342761388887 | 33.505 |
| 3.1422969513333334 | 33.49 |
| 3.1453626822222223 | 33.49 |
| 3.148424524027778 | 33.49 |
| 3.151497755361111 | 33.482 |
| 3.1545629306666667 | 33.49 |
| 3.1576308839444445 | 33.497 |
| 3.160690225583333 | 33.49 |
| 3.1637740130833336 | 33.513 |
| 3.1668372438333336 | 33.497 |
| 3.169897141083333 | 33.49 |
| 3.1729578716944444 | 33.505 |
| 3.1760172133333335 | 33.482 |
| 3.1790768327777776 | 33.505 |
| 3.1821386745833333 | 33.505 |
| 3.1852057944722225 | 33.513 |
| 3.188267080666667 | 33.505 |
| 3.1913344783333333 | 33.513 |
| 3.1943960423333335 | 33.49 |
| 3.197455383972222 | 33.49 |
| 3.200515559027778 | 33.513 |
| 3.203575178472222 | 33.49 |
| 3.2066342423055554 | 33.505 |
| 3.2096971952777777 | 33.505 |
| 3.212758759277778 | 33.505 |
| 3.215818378722222 | 33.505 |
| 3.2188788315555557 | 33.49 |
| 3.2219428956944447 | 33.49 |
| 3.225003348527778 | 33.513 |
| 3.2280660236944443 | 33.52 |
| 3.2311250875555557 | 33.513 |
| 3.234185540388889 | 33.505 |
| 3.237255716 | 33.52 |
| 3.2403172799999997 | 33.505 |
| 3.243377455027778 | 33.513 |
| 3.246440685777778 | 33.505 |
| 3.2495016941944446 | 33.505 |
| 3.2525646471666665 | 33.52 |
| 3.255624266611111 | 33.52 |
| 3.2586958311944443 | 33.528 |
| 3.261757672972222 | 33.52 |
| 3.2648167368333336 | 33.505 |
| 3.2678760784722223 | 33.52 |
| 3.270937642472222 | 33.528 |
| 3.2739972619166666 | 33.505 |
| 3.277059937111111 | 33.536 |
| 3.2801212233055552 | 33.528 |
| 3.2831819539166665 | 33.513 |
| 3.286241573388889 | 33.505 |
| 3.289308971055555 | 33.528 |
| 3.2923691460833333 | 33.528 |
| 3.295429321111111 | 33.528 |
| 3.298491162888889 | 33.52 |
| 3.3015543936666663 | 33.505 |
| 3.3046137353055554 | 33.52 |
| 3.307673076972222 | 33.52 |
| 3.310733807583333 | 33.513 |
| 3.313798705111111 | 33.513 |
| 3.3168586023333333 | 33.513 |
| 3.3199179439999997 | 33.528 |
| 3.322977007861111 | 33.52 |
| 3.3260394052500004 | 33.513 |
| 3.3291098586388888 | 33.505 |
| 3.332169200277778 | 33.52 |
| 3.335231875472222 | 33.505 |
| 3.338297050777778 | 33.52 |
| 3.3413594481666666 | 33.528 |
| 3.3444243456944442 | 33.505 |
| 3.3474920211388888 | 33.513 |
| 3.3505519183888888 | 33.505 |
| 3.353612093416667 | 33.49 |
| 3.3566719906666664 | 33.513 |
| 3.3597363325833336 | 33.49 |
| 3.362799007777778 | 33.52 |
| 3.3658600161666667 | 33.505 |
| 3.3689243581111112 | 33.505 |
| 3.371989255638889 | 33.49 |
| 3.375049152888889 | 33.505 |
| 3.3781087723333334 | 33.482 |
| 3.3811681139722225 | 33.482 |
| 3.3842310669444444 | 33.49 |
| 3.3872931865277778 | 33.49 |
| 3.39036725125 | 33.482 |
| 3.393427426277778 | 33.49 |
| 3.396500379805556 | 33.467 |
| 3.3995677774722224 | 33.467 |
| 3.4026307304444448 | 33.467 |
| 3.4056922944444445 | 33.482 |
| 3.4087602477222223 | 33.459 |
| 3.4118193115555555 | 33.452 |
| 3.4148819867499998 | 33.467 |
| 3.4179504955833333 | 33.459 |
| 3.4210109484166664 | 33.459 |
| 3.4240714012222226 | 33.444 |
| 3.427130742888889 | 33.467 |
| 3.4301923068888893 | 33.459 |
| 3.4332530374999997 | 33.474 |
| 3.4363165460555556 | 33.474 |
| 3.439379499027778 | 33.452 |
| 3.4424457855277777 | 33.452 |
| 3.445505404972222 | 33.444 |
| 3.448566413388889 | 33.467 |
| 3.4516268661944443 | 33.467 |
| 3.4546892635833335 | 33.452 |
| 3.4577488830277776 | 33.459 |
| 3.460808502472222 | 33.444 |
| 3.4638789558611114 | 33.452 |
| 3.466939130916667 | 33.452 |
| 3.470000417111111 | 33.459 |
| 3.4730617033333333 | 33.452 |
| 3.4761246562777774 | 33.459 |
| 3.479186498083333 | 33.459 |
| 3.4822466731111112 | 33.452 |
| 3.4853060147777777 | 33.459 |
| 3.4883664675833335 | 33.459 |
| 3.4914277538055556 | 33.444 |
| 3.4944870954444442 | 33.452 |
| 3.497547548277778 | 33.467 |
| 3.5006093900555557 | 33.444 |
| 3.5036690095 | 33.467 |
| 3.5067294623333334 | 33.459 |
| 3.5097996379444445 | 33.459 |
| 3.512859257388889 | 33.444 |
| 3.5159194324166667 | 33.444 |
| 3.5189812742222224 | 33.459 |
| 3.5220420048333336 | 33.459 |
| 3.525105513388889 | 33.459 |
| 3.528168466361111 | 33.467 |
| 3.5312344750555558 | 33.467 |
| 3.534298539194445 | 33.474 |
| 3.537359269805555 | 33.444 |
| 3.5404200004444446 | 33.467 |
| 3.543486009138889 | 33.49 |
| 3.546553962388889 | 33.474 |
| 3.5496135818333334 | 33.467 |
| 3.552677923777778 | 33.49 |
| 3.555741154527778 | 33.49 |
| 3.558801607361111 | 33.467 |
| 3.5618617823888887 | 33.49 |
| 3.564922513 | 33.467 |
| 3.56798241025 | 33.49 |
| 3.571042585277778 | 33.482 |
| 3.574104149277778 | 33.474 |
| 3.577169602388889 | 33.49 |
| 3.580229221833333 | 33.49 |
| 3.5832885635 | 33.49 |
| 3.5863490163055554 | 33.49 |
| 3.5894153028055555 | 33.497 |
| 3.5924782557777775 | 33.497 |
| 3.5955384308055556 | 33.49 |
| 3.598603606138889 | 33.49 |
| 3.6016635033611113 | 33.513 |
| 3.6047275675000003 | 33.497 |
| 3.6077899648888887 | 33.497 |
| 3.6108526400555556 | 33.513 |
| 3.6139142040555554 | 33.497 |
| 3.6169735457222223 | 33.505 |
| 3.620033998555556 | 33.49 |
| 3.62310000725 | 33.513 |
| 3.6261607378611114 | 33.513 |
| 3.6292211906944445 | 33.513 |
| 3.6322810879166667 | 33.497 |
| 3.635340429583333 | 33.513 |
| 3.63840310475 | 33.505 |
| 3.641469669027778 | 33.52 |
| 3.644529566277778 | 33.513 |
| 3.6475897413055556 | 33.513 |
| 3.6506513053055554 | 33.505 |
| 3.653711758138889 | 33.513 |
| 3.656771377583333 | 33.513 |
| 3.6598340527500004 | 33.52 |
| 3.662893394416667 | 33.536 |
| 3.665953013861111 | 33.513 |
| 3.669021244888889 | 33.528 |
| 3.6720825311111107 | 33.528 |
| 3.6751457618611107 | 33.528 |
| 3.678210659388889 | 33.513 |
| 3.6812755569166664 | 33.528 |
| 3.6843368431111108 | 33.52 |
| 3.6873964625555558 | 33.528 |
| 3.6904580265555555 | 33.528 |
| 3.6935220907222224 | 33.528 |
| 3.696581710166667 | 33.543 |
| 3.699641607388889 | 33.528 |
| 3.7027015046388887 | 33.536 |
| 3.7057636242222225 | 33.543 |
| 3.7088232436666666 | 33.543 |
| 3.711882863111111 | 33.536 |
| 3.714943038138889 | 33.551 |
| 3.7180051577222226 | 33.543 |
| 3.721067832916667 | 33.536 |
| 3.7241293969166667 | 33.551 |
| 3.7271951278055555 | 33.536 |
| 3.730255580638889 | 33.551 |
| 3.7333149222777777 | 33.528 |
| 3.7363773196666665 | 33.551 |
| 3.7394399948333334 | 33.551 |
| 3.7424993365 | 33.543 |
| 3.745558678138889 | 33.558 |
| 3.7486227422777776 | 33.543 |
| 3.7516837506944447 | 33.551 |
| 3.7547436479444443 | 33.566 |
| 3.7578146569166666 | 33.551 |
| 3.7608739985833335 | 33.558 |
| 3.763936118166667 | 33.574 |
| 3.7669954598055555 | 33.566 |
| 3.770057579388889 | 33.543 |
| 3.773121087944445 | 33.558 |
| 3.7761809851944443 | 33.566 |
| 3.7792406046388893 | 33.566 |
| 3.7823080023055557 | 33.566 |
| 3.7853706774722222 | 33.574 |
| 3.7884308525277777 | 33.574 |
| 3.7915015836944446 | 33.574 |
| 3.794564258888889 | 33.589 |
| 3.797624156111111 | 33.581 |
| 3.8006923871666665 | 33.574 |
| 3.8037525621944446 | 33.574 |
| 3.80681607075 | 33.574 |
| 3.8098754124166665 | 33.574 |
| 3.8129366986111113 | 33.581 |
| 3.815997151444445 | 33.551 |
| 3.819057882055555 | 33.589 |
| 3.8221175015 | 33.574 |
| 3.825178787722222 | 33.581 |
| 3.828259519472222 | 33.574 |
| 3.8313224724444446 | 33.589 |
| 3.8343818140833337 | 33.597 |
| 3.837442266916667 | 33.581 |
| 3.8405038309166666 | 33.589 |
| 3.8435640059444443 | 33.589 |
| 3.8466247365833333 | 33.581 |
| 3.849684078222222 | 33.589 |
| 3.8527453644166663 | 33.574 |
| 3.8558049838611113 | 33.589 |
| 3.8588643255277777 | 33.589 |
| 3.861925611722222 | 33.581 |
| 3.864986620138889 | 33.581 |
| 3.8680459618055556 | 33.581 |
| 3.871108636972222 | 33.574 |
| 3.874167978611111 | 33.574 |
| 3.8772284314444443 | 33.597 |
| 3.88029027325 | 33.574 |
| 3.883356004138889 | 33.581 |
| 3.8864172903611114 | 33.589 |
| 3.8894802433333333 | 33.581 |
| 3.8925393071666665 | 33.597 |
| 3.895600315583333 | 33.597 |
| 3.8986674354722224 | 33.558 |
| 3.9017273326944446 | 33.589 |
| 3.9047886189166667 | 33.581 |
| 3.907849905111111 | 33.581 |
| 3.9109092467777775 | 33.581 |
| 3.9139685884166666 | 33.574 |
| 3.917036263888889 | 33.589 |
| 3.9200967166944443 | 33.589 |
| 3.923162447611111 | 33.566 |
| 3.92622651175 | 33.581 |
| 3.9292900203055554 | 33.581 |
| 3.9323507509166666 | 33.566 |
| 3.9354120371388888 | 33.574 |
| 3.938479157 | 33.566 |
| 3.9415482214444446 | 33.574 |
| 3.944609229861111 | 33.558 |
| 3.9476685715 | 33.551 |
| 3.9507315244722223 | 33.551 |
| 3.953792532888889 | 33.528 |
| 3.956856319222222 | 33.551 |
| 3.9599301061666665 | 33.551 |
| 3.9629894478055556 | 33.551 |
| 3.966051011805556 | 33.551 |
| 3.969111464638889 | 33.551 |
| 3.9721730286388888 | 33.543 |
| 3.9752326480833333 | 33.551 |
| 3.978292823111111 | 33.536 |
| 3.981352998138889 | 33.528 |
| 3.984413450972222 | 33.536 |
| 3.9874725148333336 | 33.543 |
| 3.990534634416667 | 33.543 |
| 3.993597587388889 | 33.536 |
| 3.996660540361111 | 33.543 |
| 3.9997196041944445 | 33.536 |
| 4.002781168194444 | 33.536 |
| 4.005847454694444 | 33.528 |
| 4.008909852083334 | 33.528 |
| 4.011969193722222 | 33.543 |
| 4.0150288131666665 | 33.536 |
| 4.018090377166667 | 33.536 |
| 4.021158330444444 | 33.513 |
| 4.0242179498888895 | 33.543 |
| 4.027279236083333 | 33.536 |
| 4.0303385777222225 | 33.528 |
| 4.033402364083333 | 33.543 |
| 4.036462261333333 | 33.528 |
| 4.039527158833334 | 33.543 |
| 4.0425948343055556 | 33.536 |
| 4.0456561205 | 33.52 |
| 4.048716851138889 | 33.513 |
| 4.051778137333334 | 33.528 |
| 4.054837479 | 33.528 |
| 4.057896820638889 | 33.52 |
| 4.060960607 | 33.513 |
| 4.064023559972222 | 33.543 |
| 4.067088457472222 | 33.536 |
| 4.070154466194444 | 33.52 |
| 4.073227141916667 | 33.536 |
| 4.076286761388889 | 33.543 |
| 4.079346380833333 | 33.528 |
| 4.082406833638888 | 33.528 |
| 4.085467008666667 | 33.543 |
| 4.088531350611111 | 33.528 |
| 4.091592359027778 | 33.536 |
| 4.094651700666667 | 33.536 |
| 4.097711042333333 | 33.528 |
| 4.100775939861111 | 33.543 |
| 4.103835003722223 | 33.536 |
| 4.106895456527778 | 33.528 |
| 4.109954798194444 | 33.558 |
| 4.113016639972222 | 33.551 |
| 4.116075703833333 | 33.536 |
| 4.119135323277778 | 33.536 |
| 4.1221966095 | 33.551 |
| 4.125257062305556 | 33.558 |
| 4.128316681749999 | 33.536 |
| 4.131376301194445 | 33.543 |
| 4.1344423099166665 | 33.536 |
| 4.1375047072777775 | 33.543 |
| 4.140565437916667 | 33.536 |
| 4.143626446305555 | 33.558 |
| 4.146686621361111 | 33.558 |
| 4.149746240805555 | 33.536 |
| 4.152806971416667 | 33.543 |
| 4.155866313055555 | 33.558 |
| 4.158928432638889 | 33.551 |
| 4.161989996666667 | 33.566 |
| 4.165056005361111 | 33.551 |
| 4.168115902583334 | 33.543 |
| 4.171176355416667 | 33.551 |
| 4.174239863972222 | 33.558 |
| 4.177299205611111 | 33.558 |
| 4.1803588250555554 | 33.574 |
| 4.183417888916667 | 33.558 |
| 4.1864786195555554 | 33.558 |
| 4.189538516777778 | 33.551 |
| 4.192598969611112 | 33.558 |
| 4.195661367 | 33.574 |
| 4.198720708638889 | 33.566 |
| 4.201780328083333 | 33.558 |
| 4.204840503111111 | 33.558 |
| 4.207900400361111 | 33.558 |
| 4.210962519944444 | 33.558 |
| 4.214026306305556 | 33.566 |
| 4.217087314694444 | 33.558 |
| 4.220146934138889 | 33.558 |
| 4.223211831666667 | 33.566 |
| 4.226275895805555 | 33.566 |
| 4.2293391265833336 | 33.581 |
| 4.232399023805556 | 33.581 |
| 4.235458365472223 | 33.566 |
| 4.238518262722223 | 33.566 |
| 4.241582882444444 | 33.574 |
| 4.244642779666667 | 33.574 |
| 4.247701843527778 | 33.566 |
| 4.250763963111111 | 33.574 |
| 4.253826916083333 | 33.566 |
| 4.256887091111111 | 33.574 |
| 4.259958100111111 | 33.574 |
| 4.263019108527778 | 33.574 |
| 4.26608372825 | 33.566 |
| 4.269147792388889 | 33.581 |
| 4.272207689638889 | 33.574 |
| 4.2752720315833335 | 33.589 |
| 4.278332762194444 | 33.589 |
| 4.2814073825 | 33.581 |
| 4.284469224277778 | 33.597 |
| 4.287529121527777 | 33.574 |
| 4.290597630361112 | 33.597 |
| 4.293659749944444 | 33.612 |
| 4.296724647472222 | 33.597 |
| 4.2997864892777775 | 33.589 |
| 4.302851664583334 | 33.597 |
| 4.305911561833333 | 33.589 |
| 4.308971736861111 | 33.597 |
| 4.312035523222223 | 33.597 |
| 4.315096809416667 | 33.589 |
| 4.31815726225 | 33.589 |
| 4.321217715055555 | 33.589 |
| 4.3242784456944445 | 33.589 |
| 4.327339731888889 | 33.581 |
| 4.330407129555556 | 33.597 |
| 4.333467026805556 | 33.612 |
| 4.336526368444445 | 33.597 |
| 4.339587376861111 | 33.597 |
| 4.342654218944444 | 33.604 |
| 4.3457146717777775 | 33.612 |
| 4.3487770691388885 | 33.581 |
| 4.351843355638889 | 33.604 |
| 4.354902697305556 | 33.612 |
| 4.357962872333333 | 33.612 |
| 4.361025825305555 | 33.604 |
| 4.364092945166666 | 33.589 |
| 4.367152286833334 | 33.604 |
| 4.370218573305555 | 33.597 |
| 4.373279303944444 | 33.619 |
| 4.376340034555556 | 33.612 |
| 4.379408821194445 | 33.612 |
| 4.382476496638889 | 33.612 |
| 4.385536116083333 | 33.612 |
| 4.3885987912777775 | 33.589 |
| 4.391660355277778 | 33.589 |
| 4.394723030444444 | 33.612 |
| 4.397782372083333 | 33.597 |
| 4.400843936083334 | 33.612 |
| 4.403905222305555 | 33.612 |
| 4.406965397333334 | 33.597 |
| 4.410025850166667 | 33.604 |
| 4.413085191805556 | 33.589 |
| 4.41614481125 | 33.597 |
| 4.419204986277777 | 33.604 |
| 4.422264050138889 | 33.604 |
| 4.425323947388889 | 33.612 |
| 4.428390233888889 | 33.597 |
| 4.431457631555555 | 33.604 |
| 4.4345169731944445 | 33.612 |
| 4.437582426305555 | 33.604 |
| 4.440642601333334 | 33.589 |
| 4.4437038875555555 | 33.604 |
| 4.446772396388889 | 33.597 |
| 4.449846183305556 | 33.589 |
| 4.452910803027778 | 33.597 |
| 4.455971533666667 | 33.604 |
| 4.459030875305555 | 33.589 |
| 4.462092994888889 | 33.597 |
| 4.465152892138889 | 33.604 |
| 4.468215845111112 | 33.597 |
| 4.471277686888889 | 33.604 |
| 4.474344528972222 | 33.589 |
| 4.4774041484166665 | 33.597 |
| 4.480465434638889 | 33.597 |
| 4.483527276416667 | 33.589 |
| 4.48658772925 | 33.597 |
| 4.4896476265 | 33.589 |
| 4.492707523722222 | 33.589 |
| 4.495767143166667 | 33.589 |
| 4.4988325962777775 | 33.589 |
| 4.501893326888889 | 33.589 |
| 4.504956835444444 | 33.589 |
| 4.508016454888889 | 33.574 |
| 4.511075796555556 | 33.574 |
| 4.514140971861111 | 33.574 |
| 4.5172005913055555 | 33.566 |
| 4.52026021075 | 33.566 |
| 4.52332177475 | 33.558 |
| 4.526384727722222 | 33.566 |
| 4.529446013944445 | 33.574 |
| 4.532507855722222 | 33.566 |
| 4.535569975305555 | 33.558 |
| 4.53863431725 | 33.543 |
| 4.541697548027778 | 33.558 |
| 4.54475744525 | 33.558 |
| 4.5478173425 | 33.543 |
| 4.550879739861111 | 33.551 |
| 4.553939359305555 | 33.558 |
| 4.55699897875 | 33.551 |
| 4.560059709388889 | 33.551 |
| 4.563123773527777 | 33.543 |
| 4.566184781944444 | 33.551 |
| 4.569244679166667 | 33.543 |
| 4.572304298611111 | 33.536 |
| 4.575363918055555 | 33.551 |
| 4.578424370888889 | 33.551 |
| 4.581483712555556 | 33.551 |
| 4.584544165361112 | 33.543 |
| 4.587604062611111 | 33.558 |
| 4.590667015583334 | 33.543 |
| 4.593728579583334 | 33.558 |
| 4.596788754611111 | 33.551 |
| 4.599850318611112 | 33.543 |
| 4.602911882611111 | 33.551 |
| 4.605979558083333 | 33.558 |
| 4.609046122361112 | 33.551 |
| 4.612109353111111 | 33.543 |
| 4.6151717505 | 33.566 |
| 4.618232758916666 | 33.551 |
| 4.621292378361111 | 33.551 |
| 4.624358664861111 | 33.558 |
| 4.6274213400277775 | 33.543 |
| 4.630484292999999 | 33.566 |
| 4.6335447458333325 | 33.551 |
| 4.636604365277778 | 33.536 |
| 4.639665095888889 | 33.566 |
| 4.6427258265 | 33.551 |
| 4.645786001527777 | 33.566 |
| 4.648845620972223 | 33.551 |
| 4.651904962638889 | 33.566 |
| 4.654964304277778 | 33.551 |
| 4.658024201527778 | 33.558 |
| 4.6610885434444445 | 33.566 |
| 4.664165663888889 | 33.558 |
| 4.667227505694444 | 33.566 |
| 4.670292681027778 | 33.574 |
| 4.673354522805555 | 33.574 |
| 4.676415253416667 | 33.574 |
| 4.679474595083334 | 33.574 |
| 4.6825375480555556 | 33.566 |
| 4.685598000861112 | 33.558 |
| 4.688660953833334 | 33.574 |
| 4.691720295500001 | 33.581 |
| 4.6947815816944445 | 33.574 |
| 4.697841756722223 | 33.581 |
| 4.70090193175 | 33.574 |
| 4.703962106805555 | 33.581 |
| 4.70702172625 | 33.589 |
| 4.710084401416666 | 33.574 |
| 4.713144298666667 | 33.581 |
| 4.7162041958888885 | 33.581 |
| 4.719266037694444 | 33.589 |
| 4.722326212722222 | 33.574 |
| 4.725399444055555 | 33.597 |
| 4.728461008055556 | 33.589 |
| 4.731520627499999 | 33.589 |
| 4.734582747083333 | 33.597 |
| 4.7376426443333335 | 33.581 |
| 4.740702541555556 | 33.597 |
| 4.743781328777779 | 33.597 |
| 4.746840948222222 | 33.597 |
| 4.749903901194445 | 33.604 |
| 4.752963520638889 | 33.612 |
| 4.756023417861111 | 33.604 |
| 4.759084981861111 | 33.612 |
| 4.7621471014444445 | 33.604 |
| 4.765206720888889 | 33.635 |
| 4.7682674515277785 | 33.604 |
| 4.771328182138888 | 33.604 |
| 4.774395301999999 | 33.612 |
| 4.7774557548333325 | 33.612 |
| 4.780519541194444 | 33.604 |
| 4.783579160638889 | 33.612 |
| 4.78663989125 | 33.619 |
| 4.789710066861112 | 33.612 |
| 4.792769964083333 | 33.619 |
| 4.7958295835277776 | 33.612 |
| 4.798891147527778 | 33.635 |
| 4.801951878166666 | 33.619 |
| 4.805011775388889 | 33.619 |
| 4.808074450583334 | 33.619 |
| 4.8111335144166665 | 33.619 |
| 4.814199800916667 | 33.627 |
| 4.81726025375 | 33.642 |
| 4.820322095527778 | 33.612 |
| 4.823381992777778 | 33.619 |
| 4.826454390722223 | 33.635 |
| 4.8295176215 | 33.627 |
| 4.832583630194444 | 33.65 |
| 4.835648249916667 | 33.642 |
| 4.838710925111111 | 33.627 |
| 4.841777489388889 | 33.642 |
| 4.844840720138889 | 33.642 |
| 4.847901728555556 | 33.635 |
| 4.850961347999999 | 33.635 |
| 4.85402124525 | 33.642 |
| 4.857081975861112 | 33.627 |
| 4.8601515958888895 | 33.635 |
| 4.8632109375277786 | 33.642 |
| 4.866271668138889 | 33.642 |
| 4.869334343333334 | 33.642 |
| 4.872396185111111 | 33.665 |
| 4.875460527055556 | 33.658 |
| 4.878522368861111 | 33.658 |
| 4.881583655055556 | 33.658 |
| 4.884646330222222 | 33.635 |
| 4.8877112277500006 | 33.665 |
| 4.890773347333334 | 33.665 |
| 4.893832966777778 | 33.673 |
| 4.896895364166666 | 33.658 |
| 4.899955539194444 | 33.665 |
| 4.9030151586388895 | 33.665 |
| 4.9060745003055555 | 33.658 |
| 4.909137453277778 | 33.658 |
| 4.912234297055555 | 33.673 |
| 4.915293638722223 | 33.665 |
| 4.918354647138888 | 33.673 |
| 4.921417600083333 | 33.658 |
| 4.92447694175 | 33.665 |
| 4.927537950166666 | 33.658 |
| 4.93060006975 | 33.673 |
| 4.933661355944444 | 33.673 |
| 4.936723475527778 | 33.688 |
| 4.939783094972222 | 33.673 |
| 4.942842158833334 | 33.673 |
| 4.9459034450555555 | 33.673 |
| 4.948963342277779 | 33.68 |
| 4.952033795694445 | 33.673 |
| 4.9550942485 | 33.68 |
| 4.958153867944445 | 33.673 |
| 4.9612132096111115 | 33.673 |
| 4.964272829055555 | 33.68 |
| 4.967333559666667 | 33.673 |
| 4.970394845888889 | 33.673 |
| 4.973455020916667 | 33.688 |
| 4.976514362555556 | 33.68 |
| 4.979575648777778 | 33.68 |
| 4.982638879527778 | 33.673 |
| 4.9856998879444445 | 33.696 |
| 4.988760618555555 | 33.688 |
| 4.991820515805555 | 33.688 |
| 4.99488902463889 | 33.68 |
| 4.997951422027778 | 33.68 |
| 5.001012986027778 | 33.696 |
| 5.004075105611111 | 33.68 |
| 5.007145836805555 | 33.696 |
| 5.010211567694444 | 33.696 |
| 5.0132734095 | 33.696 |
| 5.016332751138889 | 33.688 |
| 5.019392092805556 | 33.688 |
| 5.022455045777778 | 33.68 |
| 5.0255196655 | 33.688 |
| 5.028579284944445 | 33.68 |
| 5.031640848944445 | 33.696 |
| 5.034706302055555 | 33.696 |
| 5.037766477083333 | 33.696 |
| 5.040825818749999 | 33.68 |
| 5.043885160388888 | 33.673 |
| 5.046948668944444 | 33.68 |
| 5.050008010611111 | 33.688 |
| 5.053072352527778 | 33.68 |
| 5.056132805361111 | 33.703 |
| 5.059193258194445 | 33.673 |
| 5.062253988805556 | 33.688 |
| 5.0653152750277775 | 33.68 |
| 5.068377394611111 | 33.68 |
| 5.07143673625 | 33.673 |
| 5.074496077916667 | 33.673 |
| 5.077555975138889 | 33.68 |
| 5.080615594583334 | 33.68 |
| 5.083677991972222 | 33.68 |
| 5.086739555972223 | 33.68 |
| 5.089808342611112 | 33.68 |
| 5.092869351027777 | 33.68 |
| 5.095931192805556 | 33.673 |
| 5.098994979166667 | 33.673 |
| 5.102058209916667 | 33.658 |
| 5.105118107166667 | 33.658 |
| 5.108184115861111 | 33.658 |
| 5.111244846472222 | 33.658 |
| 5.1143050215 | 33.65 |
| 5.1173663077222225 | 33.658 |
| 5.120429538472222 | 33.642 |
| 5.123489991305556 | 33.665 |
| 5.126550166333333 | 33.642 |
| 5.129610619166667 | 33.658 |
| 5.13267357213889 | 33.65 |
| 5.135732913777778 | 33.665 |
| 5.1387994780833335 | 33.635 |
| 5.141859375305556 | 33.642 |
| 5.144923439444445 | 33.642 |
| 5.147986392416667 | 33.642 |
| 5.151046289666667 | 33.612 |
| 5.154105909111111 | 33.658 |
| 5.157165528555556 | 33.635 |
| 5.16022681475 | 33.627 |
| 5.1632867120000006 | 33.627 |
| 5.166347442611111 | 33.642 |
| 5.169409284416667 | 33.612 |
| 5.172468626055556 | 33.635 |
| 5.175527689916667 | 33.635 |
| 5.178587864944444 | 33.635 |
| 5.181649428944445 | 33.627 |
| 5.184709603972223 | 33.627 |
| 5.187769223416667 | 33.612 |
| 5.190828287277777 | 33.627 |
| 5.193887906722223 | 33.619 |
| 5.196947803972222 | 33.619 |
| 5.200007145611111 | 33.627 |
| 5.203071765333333 | 33.635 |
| 5.206131940388889 | 33.627 |
| 5.209191004222221 | 33.619 |
| 5.212253957194444 | 33.619 |
| 5.21531413225 | 33.619 |
| 5.218374307277777 | 33.619 |
| 5.221437538027778 | 33.627 |
| 5.224496879694444 | 33.612 |
| 5.227556776916667 | 33.612 |
| 5.230620563277778 | 33.619 |
| 5.23368351625 | 33.619 |
| 5.236746469194444 | 33.619 |
| 5.239808311 | 33.612 |
| 5.2428679304444445 | 33.604 |
| 5.245930327833333 | 33.627 |
| 5.248998558888888 | 33.612 |
| 5.2520592895 | 33.612 |
| 5.255122242472223 | 33.619 |
| 5.258192418055556 | 33.619 |
| 5.261251759722222 | 33.619 |
| 5.264311379166666 | 33.612 |
| 5.2673782212499995 | 33.635 |
| 5.2704406186111115 | 33.619 |
| 5.2735057939444445 | 33.627 |
| 5.276568469111111 | 33.619 |
| 5.279627810777777 | 33.635 |
| 5.282687430222222 | 33.635 |
| 5.2857484386388895 | 33.642 |
| 5.288807780277779 | 33.642 |
| 5.291871566638888 | 33.627 |
| 5.294931463861111 | 33.619 |
| 5.297991638888889 | 33.635 |
| 5.301059869944444 | 33.635 |
| 5.3041283787777775 | 33.627 |
| 5.307189942777778 | 33.627 |
| 5.310254006944445 | 33.65 |
| 5.313318904444444 | 33.642 |
| 5.316379357277778 | 33.642 |
| 5.319441199083333 | 33.635 |
| 5.322501651888889 | 33.642 |
| 5.325564327083334 | 33.642 |
| 5.328623668722222 | 33.658 |
| 5.3316868995 | 33.635 |
| 5.334752352611111 | 33.635 |
| 5.337814472194445 | 33.642 |
| 5.3408765917777785 | 33.658 |
| 5.343938711361112 | 33.642 |
| 5.347007498 | 33.658 |
| 5.350069617583333 | 33.65 |
| 5.35312895925 | 33.642 |
| 5.356189967638889 | 33.65 |
| 5.359250698277778 | 33.65 |
| 5.362311706694444 | 33.658 |
| 5.365373548472222 | 33.665 |
| 5.368433167916667 | 33.665 |
| 5.371493065166667 | 33.65 |
| 5.3745537957777785 | 33.65 |
| 5.377613415222222 | 33.665 |
| 5.380673312472222 | 33.642 |
| 5.383735709833333 | 33.665 |
| 5.386795329277778 | 33.665 |
| 5.389857171083333 | 33.68 |
| 5.392917901694444 | 33.658 |
| 5.395979465694444 | 33.658 |
| 5.399042140888889 | 33.665 |
| 5.402101482527778 | 33.688 |
| 5.405160824166667 | 33.658 |
| 5.40823711125 | 33.673 |
| 5.411297286277778 | 33.68 |
| 5.4143716287777774 | 33.665 |
| 5.417432081611111 | 33.68 |
| 5.42049142325 | 33.688 |
| 5.423550487111111 | 33.673 |
| 5.426611495527778 | 33.658 |
| 5.429671670555556 | 33.68 |
| 5.432733234555555 | 33.658 |
| 5.435793687388888 | 33.68 |
| 5.438853584638889 | 33.673 |
| 5.441913204083333 | 33.673 |
| 5.444976434833333 | 33.673 |
| 5.448035498694444 | 33.673 |
| 5.451094840333333 | 33.688 |
| 5.454160015666666 | 33.68 |
| 5.457227413333333 | 33.696 |
| 5.460290644083333 | 33.68 |
| 5.4633549860277775 | 33.696 |
| 5.4664148832777775 | 33.68 |
| 5.469476725055556 | 33.688 |
| 5.472536622305555 | 33.696 |
| 5.4755976307222225 | 33.673 |
| 5.478665306166667 | 33.696 |
| 5.481725759 | 33.696 |
| 5.484791212111111 | 33.696 |
| 5.487851942722222 | 33.696 |
| 5.490911562166667 | 33.696 |
| 5.493971459416667 | 33.703 |
| 5.497032467833334 | 33.703 |
| 5.50009347625 | 33.703 |
| 5.503155318027778 | 33.703 |
| 5.506214381888889 | 33.711 |
| 5.509274556916667 | 33.719 |
| 5.5123372320833335 | 33.703 |
| 5.515396295944444 | 33.719 |
| 5.5184611934722225 | 33.703 |
| 5.521526091 | 33.703 |
| 5.524587377222222 | 33.719 |
| 5.527650607972222 | 33.711 |
| 5.530711338583334 | 33.711 |
| 5.533771235833333 | 33.719 |
| 5.536831966444445 | 33.719 |
| 5.539904086611112 | 33.703 |
| 5.542964817222222 | 33.703 |
| 5.546030270333333 | 33.726 |
| 5.549091834333334 | 33.711 |
| 5.552151453777777 | 33.719 |
| 5.555213573361111 | 33.719 |
| 5.558285137944444 | 33.726 |
| 5.561345868555556 | 33.719 |
| 5.564414933 | 33.703 |
| 5.567476774777778 | 33.726 |
| 5.570536672027777 | 33.711 |
| 5.573596847055556 | 33.719 |
| 5.576655910916667 | 33.719 |
| 5.579721364027777 | 33.719 |
| 5.5827815390555555 | 33.719 |
| 5.5858411585 | 33.719 |
| 5.588901889111111 | 33.726 |
| 5.591962341944444 | 33.719 |
| 5.595022239194445 | 33.734 |
| 5.598083525388889 | 33.734 |
| 5.6011442559999995 | 33.719 |
| 5.60420415325 | 33.719 |
| 5.607267939611111 | 33.719 |
| 5.610330336972222 | 33.703 |
| 5.613391067611111 | 33.719 |
| 5.61645040925 | 33.711 |
| 5.61951197325 | 33.719 |
| 5.622571592694444 | 33.719 |
| 5.6256334345 | 33.719 |
| 5.628693053944445 | 33.711 |
| 5.631752395583333 | 33.726 |
| 5.634815348555556 | 33.711 |
| 5.637874968 | 33.719 |
| 5.640935976416666 | 33.711 |
| 5.644000318361111 | 33.711 |
| 5.64706132675 | 33.703 |
| 5.650120668416666 | 33.726 |
| 5.653180010055555 | 33.719 |
| 5.6562415740555565 | 33.703 |
| 5.659301749111112 | 33.719 |
| 5.662363035305555 | 33.703 |
| 5.665425154888888 | 33.703 |
| 5.668485329916667 | 33.703 |
| 5.671544671583333 | 33.711 |
| 5.6746054021944445 | 33.703 |
| 5.677665021638889 | 33.703 |
| 5.680724641083333 | 33.719 |
| 5.6837856495 | 33.68 |
| 5.686847769083333 | 33.711 |
| 5.689916000138889 | 33.688 |
| 5.692975619583334 | 33.703 |
| 5.696036350194444 | 33.711 |
| 5.699095969638889 | 33.688 |
| 5.702155866888889 | 33.703 |
| 5.705216875305555 | 33.673 |
| 5.708280661638889 | 33.673 |
| 5.711345836972222 | 33.68 |
| 5.714422401805555 | 33.688 |
| 5.71748202125 | 33.688 |
| 5.720544418638889 | 33.688 |
| 5.723607927194444 | 33.696 |
| 5.726668102222222 | 33.688 |
| 5.729728832861111 | 33.68 |
| 5.732792063611111 | 33.68 |
| 5.735851960861112 | 33.68 |
| 5.738917136166667 | 33.68 |
| 5.741977311194445 | 33.688 |
| 5.745036652861112 | 33.68 |
| 5.748101550388889 | 33.68 |
| 5.751162003194445 | 33.665 |
| 5.754221622638889 | 33.688 |
| 5.757281242083333 | 33.665 |
| 5.760342528305556 | 33.68 |
| 5.763416593027777 | 33.68 |
| 5.766477045833333 | 33.68 |
| 5.7695394432222225 | 33.673 |
| 5.77260045163889 | 33.673 |
| 5.775659793277778 | 33.673 |
| 5.778720801694444 | 33.688 |
| 5.781781810111111 | 33.665 |
| 5.78484115175 | 33.65 |
| 5.7879038269444445 | 33.665 |
| 5.790980669583333 | 33.68 |
| 5.79404001125 | 33.68 |
| 5.797099075111111 | 33.68 |
| 5.800159527916667 | 33.68 |
| 5.80321998075 | 33.665 |
| 5.806285156055555 | 33.665 |
| 5.809346164472222 | 33.688 |
| 5.812407172888888 | 33.673 |
| 5.815469570277777 | 33.658 |
| 5.818533634416666 | 33.68 |
| 5.8215968651944445 | 33.68 |
| 5.824660929333334 | 33.688 |
| 5.827720826555556 | 33.688 |
| 5.830788779805555 | 33.68 |
| 5.833850066027778 | 33.68 |
| 5.836910796638889 | 33.688 |
| 5.8399731940277775 | 33.68 |
| 5.843036146999999 | 33.696 |
| 5.846101044527778 | 33.688 |
| 5.849160663972222 | 33.688 |
| 5.852219727805555 | 33.703 |
| 5.855280180638888 | 33.68 |
| 5.8583417446388895 | 33.688 |
| 5.861403586444444 | 33.68 |
| 5.864463761472222 | 33.696 |
| 5.867525881055555 | 33.703 |
| 5.870588278444444 | 33.696 |
| 5.8736509536111114 | 33.703 |
| 5.876710017472223 | 33.703 |
| 5.8797701925000005 | 33.703 |
| 5.882830367527777 | 33.688 |
| 5.885890542555555 | 33.688 |
| 5.88895071761111 | 33.703 |
| 5.8920147817499995 | 33.696 |
| 5.895074956777778 | 33.703 |
| 5.898138465333334 | 33.711 |
| 5.901199751527778 | 33.711 |
| 5.904259093194445 | 33.711 |
| 5.907318990416667 | 33.703 |
| 5.9103780542777775 | 33.688 |
| 5.913437951527778 | 33.703 |
| 5.916498126555555 | 33.719 |
| 5.919558857166667 | 33.719 |
| 5.92262097675 | 33.726 |
| 5.925681707388889 | 33.726 |
| 5.928749105055555 | 33.726 |
| 5.931808446694444 | 33.726 |
| 5.9348700106944445 | 33.734 |
| 5.9379293523611105 | 33.734 |
| 5.941008972944444 | 33.726 |
| 5.944068592388889 | 33.734 |
| 5.947134323277778 | 33.742 |
| 5.9501944983333335 | 33.742 |
| 5.953263840555556 | 33.742 |
| 5.956326237916667 | 33.726 |
| 5.95939308 | 33.749 |
| 5.9624526994444444 | 33.726 |
| 5.96551204111111 | 33.719 |
| 5.968572771722222 | 33.734 |
| 5.971637113666667 | 33.742 |
| 5.974697288694444 | 33.742 |
| 5.977756352555556 | 33.764 |
| 5.980818194333333 | 33.742 |
| 5.983877258194444 | 33.749 |
| 5.9869391 | 33.749 |
| 5.989998997222222 | 33.742 |
| 5.993059450055555 | 33.742 |
| 5.996118791722223 | 33.757 |
| 5.999179244527778 | 33.749 |
| 6.002241086333333 | 33.749 |
| 6.005300705777778 | 33.749 |
| 6.008367825638889 | 33.749 |
| 6.0114277228888895 | 33.742 |
| 6.014488175722223 | 33.742 |
| 6.017551962055555 | 33.749 |
| 6.020612970472222 | 33.749 |
| 6.023677312416667 | 33.757 |
| 6.026738043027778 | 33.749 |
| 6.02980266275 | 33.749 |
| 6.032863393388888 | 33.749 |
| 6.035923568416667 | 33.764 |
| 6.038982910055555 | 33.749 |
| 6.0420514189166665 | 33.764 |
| 6.045117427611111 | 33.764 |
| 6.048178158222223 | 33.749 |
| 6.051239166638888 | 33.757 |
| 6.054298508277777 | 33.764 |
| 6.057358405527778 | 33.764 |
| 6.060423303055556 | 33.757 |
| 6.06348458925 | 33.757 |
| 6.066548375611111 | 33.78 |
| 6.069609106222222 | 33.742 |
| 6.0726687256666665 | 33.772 |
| 6.075732512027778 | 33.757 |
| 6.07879240925 | 33.764 |
| 6.0818523065 | 33.764 |
| 6.084914703888889 | 33.764 |
| 6.087974323333333 | 33.757 |
| 6.091036442916667 | 33.749 |
| 6.094097451333334 | 33.78 |
| 6.097159293111111 | 33.787 |
| 6.100220023722223 | 33.757 |
| 6.103280476555556 | 33.78 |
| 6.106342596138889 | 33.78 |
| 6.109404993527778 | 33.764 |
| 6.112465446361111 | 33.795 |
| 6.115528399333333 | 33.78 |
| 6.118591907888889 | 33.795 |
| 6.121651805111111 | 33.795 |
| 6.124714480305555 | 33.78 |
| 6.1277749331111115 | 33.787 |
| 6.130836219333333 | 33.78 |
| 6.133898338916667 | 33.795 |
| 6.136959069527777 | 33.81 |
| 6.140022855888889 | 33.795 |
| 6.143083030916666 | 33.803 |
| 6.146142650361112 | 33.803 |
| 6.149204492166667 | 33.803 |
| 6.152263833805556 | 33.78 |
| 6.155323731055556 | 33.81 |
| 6.158385572833333 | 33.803 |
| 6.161445470083334 | 33.78 |
| 6.164505089527777 | 33.787 |
| 6.167573598361111 | 33.795 |
| 6.170633217805555 | 33.803 |
| 6.17369283725 | 33.803 |
| 6.1767527345 | 33.78 |
| 6.179812909527778 | 33.787 |
| 6.182873084555555 | 33.795 |
| 6.185932704 | 33.803 |
| 6.1889934346111115 | 33.78 |
| 6.192058887722222 | 33.78 |
| 6.195124063055556 | 33.787 |
| 6.1981836825 | 33.787 |
| 6.201246635472223 | 33.78 |
| 6.204305977111112 | 33.803 |
| 6.207365040972221 | 33.78 |
| 6.210424660416667 | 33.787 |
| 6.213493447055556 | 33.787 |
| 6.216553344277777 | 33.78 |
| 6.219612963722223 | 33.795 |
| 6.222672860972222 | 33.78 |
| 6.225734424972223 | 33.787 |
| 6.228800155888889 | 33.78 |
| 6.231866720166667 | 33.78 |
| 6.234929117555555 | 33.78 |
| 6.237988459194444 | 33.78 |
| 6.241049189805556 | 33.787 |
| 6.2441085314722224 | 33.764 |
| 6.247168150916666 | 33.78 |
| 6.250227492555555 | 33.78 |
| 6.253288500972222 | 33.764 |
| 6.256348120416667 | 33.78 |
| 6.259411351194445 | 33.78 |
| 6.2624712484166665 | 33.78 |
| 6.2655347569722215 | 33.757 |
| 6.268594654222222 | 33.764 |
| 6.271661774083333 | 33.749 |
| 6.274721671333333 | 33.757 |
| 6.2777957360277785 | 33.787 |
| 6.280855355472222 | 33.772 |
| 6.283920808611112 | 33.772 |
| 6.286980150250001 | 33.772 |
| 6.2900419920555555 | 33.764 |
| 6.2931016115 | 33.757 |
| 6.2961631755 | 33.757 |
| 6.299225295083334 | 33.764 |
| 6.302289637 | 33.772 |
| 6.305348978666666 | 33.772 |
| 6.308408320305555 | 33.772 |
| 6.311469050944445 | 33.78 |
| 6.3145325595 | 33.757 |
| 6.317594679083333 | 33.757 |
| 6.320654298527778 | 33.764 |
| 6.323713917972222 | 33.757 |
| 6.326779093277778 | 33.772 |
| 6.3298389905277785 | 33.772 |
| 6.332899998944444 | 33.757 |
| 6.335962951916667 | 33.757 |
| 6.3390250715 | 33.764 |
| 6.342085524305555 | 33.78 |
| 6.345150699638889 | 33.764 |
| 6.348219486277778 | 33.757 |
| 6.351280494694444 | 33.757 |
| 6.354340391916667 | 33.757 |
| 6.3574025115 | 33.772 |
| 6.360463797722222 | 33.772 |
| 6.363524250555555 | 33.772 |
| 6.36658387 | 33.772 |
| 6.369644045027777 | 33.757 |
| 6.3727067201944445 | 33.772 |
| 6.375766061833334 | 33.787 |
| 6.378830959361111 | 33.78 |
| 6.381890578805556 | 33.772 |
| 6.384950198249999 | 33.787 |
| 6.388009817694445 | 33.772 |
| 6.39107332625 | 33.772 |
| 6.394133779083333 | 33.772 |
| 6.397196176472223 | 33.772 |
| 6.400261074 | 33.787 |
| 6.4033209712222225 | 33.78 |
| 6.406385313166666 | 33.787 |
| 6.409446877166666 | 33.787 |
| 6.412508441166667 | 33.787 |
| 6.415574727666667 | 33.787 |
| 6.418634624888889 | 33.795 |
| 6.421695355527778 | 33.787 |
| 6.424754419388889 | 33.795 |
| 6.4278154277777775 | 33.795 |
| 6.430879491944444 | 33.795 |
| 6.4339393891666665 | 33.787 |
| 6.437003453305556 | 33.803 |
| 6.440064183944444 | 33.795 |
| 6.443124358972222 | 33.795 |
| 6.446183978416667 | 33.803 |
| 6.449243597861111 | 33.795 |
| 6.452302661722222 | 33.795 |
| 6.455362281166667 | 33.803 |
| 6.458424956333333 | 33.81 |
| 6.461484575777778 | 33.81 |
| 6.4645441952222225 | 33.795 |
| 6.467604925833333 | 33.81 |
| 6.470668989972221 | 33.795 |
| 6.473745554833333 | 33.795 |
| 6.47680656325 | 33.825 |
| 6.479865904916667 | 33.818 |
| 6.482929413472222 | 33.81 |
| 6.485990699666666 | 33.818 |
| 6.489050596916667 | 33.795 |
| 6.492111605305556 | 33.803 |
| 6.495170946972222 | 33.803 |
| 6.498232788777777 | 33.825 |
| 6.501294074972222 | 33.818 |
| 6.504357027944444 | 33.81 |
| 6.507416647388889 | 33.81 |
| 6.510480989333334 | 33.81 |
| 6.513540608777777 | 33.818 |
| 6.516602450555555 | 33.81 |
| 6.519669570444444 | 33.81 |
| 6.5227291898888895 | 33.825 |
| 6.525789087111111 | 33.833 |
| 6.528849262138889 | 33.81 |
| 6.531908326000001 | 33.81 |
| 6.534971001194444 | 33.818 |
| 6.538031731805556 | 33.825 |
| 6.541109963416667 | 33.833 |
| 6.544170694027778 | 33.825 |
| 6.547235869361112 | 33.825 |
| 6.5502960443888885 | 33.825 |
| 6.553356775 | 33.833 |
| 6.556416394444445 | 33.81 |
| 6.55947823625 | 33.825 |
| 6.562538133472222 | 33.833 |
| 6.565597475138889 | 33.818 |
| 6.568657372388889 | 33.81 |
| 6.571716991833333 | 33.818 |
| 6.574777722444445 | 33.825 |
| 6.577838730861111 | 33.833 |
| 6.580900850444444 | 33.841 |
| 6.583962414444445 | 33.825 |
| 6.587026200777778 | 33.825 |
| 6.5900972097777775 | 33.833 |
| 6.593157662611111 | 33.825 |
| 6.596220615555556 | 33.841 |
| 6.5992846797222215 | 33.833 |
| 6.602346243722223 | 33.833 |
| 6.605406140944444 | 33.825 |
| 6.6084668715833335 | 33.833 |
| 6.611526213222223 | 33.833 |
| 6.614585554861112 | 33.833 |
| 6.617649896805555 | 33.825 |
| 6.620712294194444 | 33.841 |
| 6.623774691583334 | 33.833 |
| 6.626837644527778 | 33.833 |
| 6.6298989307500005 | 33.848 |
| 6.632958272388889 | 33.833 |
| 6.636017891833333 | 33.833 |
| 6.639078344666666 | 33.848 |
| 6.642162132166667 | 33.833 |
| 6.6452228627777785 | 33.848 |
| 6.648282760027778 | 33.864 |
| 6.65134737975 | 33.841 |
| 6.654409221555556 | 33.848 |
| 6.657469118777778 | 33.856 |
| 6.6605320717500005 | 33.841 |
| 6.6635955803055555 | 33.833 |
| 6.666659366666667 | 33.841 |
| 6.669719541694445 | 33.848 |
| 6.672779716722222 | 33.833 |
| 6.675839336166667 | 33.841 |
| 6.6788995111944445 | 33.841 |
| 6.681960797416666 | 33.848 |
| 6.685020694638889 | 33.841 |
| 6.688081147472222 | 33.856 |
| 6.691140766916666 | 33.841 |
| 6.694203164305556 | 33.856 |
| 6.6972727843055555 | 33.841 |
| 6.700336570666666 | 33.848 |
| 6.7033967456944445 | 33.833 |
| 6.7064566429444445 | 33.833 |
| 6.709515984583334 | 33.856 |
| 6.712579770944445 | 33.848 |
| 6.715639112583333 | 33.856 |
| 6.718700954388889 | 33.848 |
| 6.721761962777778 | 33.848 |
| 6.724821304444444 | 33.841 |
| 6.7278812016666665 | 33.833 |
| 6.730942487888889 | 33.833 |
| 6.734004051888889 | 33.856 |
| 6.737067282638889 | 33.833 |
| 6.740126902083333 | 33.848 |
| 6.743186799333333 | 33.833 |
| 6.746248085527778 | 33.841 |
| 6.749308260583334 | 33.833 |
| 6.752367880027777 | 33.833 |
| 6.755436111055555 | 33.825 |
| 6.758502953138889 | 33.818 |
| 6.761566461694445 | 33.825 |
| 6.764626081138888 | 33.833 |
| 6.76769153425 | 33.818 |
| 6.770750875916667 | 33.841 |
| 6.7738129955 | 33.818 |
| 6.776884560055556 | 33.81 |
| 6.77994723525 | 33.833 |
| 6.783007132472222 | 33.81 |
| 6.786069529861111 | 33.833 |
| 6.789129149305555 | 33.833 |
| 6.792208769888888 | 33.825 |
| 6.795273389638889 | 33.81 |
| 6.798333009083333 | 33.818 |
| 6.801393461888888 | 33.818 |
| 6.8044541925277775 | 33.833 |
| 6.807513811972222 | 33.833 |
| 6.810573431416667 | 33.803 |
| 6.813632773055556 | 33.818 |
| 6.8166940592500005 | 33.803 |
| 6.819753678694444 | 33.795 |
| 6.822818576222223 | 33.803 |
| 6.825877917888889 | 33.795 |
| 6.828939204083333 | 33.81 |
| 6.831999101333333 | 33.818 |
| 6.835060665333334 | 33.81 |
| 6.838125840638889 | 33.803 |
| 6.841192404944445 | 33.818 |
| 6.844253968944444 | 33.81 |
| 6.847313310583333 | 33.803 |
| 6.8503723744444445 | 33.803 |
| 6.8534406055 | 33.803 |
| 6.8564999471388886 | 33.818 |
| 6.8595603999722226 | 33.818 |
| 6.86262140838889 | 33.825 |
| 6.865681305611111 | 33.833 |
| 6.868743703 | 33.81 |
| 6.8718061003888895 | 33.833 |
| 6.874866831 | 33.818 |
| 6.87792672825 | 33.825 |
| 6.88098829225 | 33.833 |
| 6.884051800805555 | 33.818 |
| 6.887111698027778 | 33.825 |
| 6.890171039694445 | 33.81 |
| 6.893230381333333 | 33.825 |
| 6.896292778722222 | 33.825 |
| 6.899353231527777 | 33.833 |
| 6.902414795527778 | 33.825 |
| 6.905476637333334 | 33.833 |
| 6.908536256777778 | 33.841 |
| 6.9115961540277775 | 33.818 |
| 6.914657162444445 | 33.833 |
| 6.91772233775 | 33.841 |
| 6.920781401611111 | 33.856 |
| 6.923853521777778 | 33.841 |
| 6.926923975166667 | 33.864 |
| 6.929991372833333 | 33.856 |
| 6.933050436694445 | 33.856 |
| 6.936109778333333 | 33.833 |
| 6.939169675583334 | 33.848 |
| 6.9422659637777775 | 33.841 |
| 6.945331972472222 | 33.856 |
| 6.948391869722222 | 33.841 |
| 6.951452322555555 | 33.848 |
| 6.954511386416667 | 33.825 |
| 6.957570728055556 | 33.864 |
| 6.960638125722222 | 33.848 |
| 6.963715246166666 | 33.864 |
| 6.966776810166667 | 33.841 |
| 6.969843374444444 | 33.841 |
| 6.972903271694444 | 33.856 |
| 6.975965669083333 | 33.864 |
| 6.979042233944445 | 33.871 |
| 6.982243250361111 | 33.864 |
| 6.985309259055556 | 33.856 |
| 6.988371100861111 | 33.871 |
| 6.991432109250001 | 33.879 |
| 6.99449117311111 | 33.879 |
| 6.997550514777778 | 33.879 |
| 7.000611523194444 | 33.879 |
| 7.003671976 | 33.886 |
| 7.006732984416667 | 33.886 |
| 7.009792326083333 | 33.879 |
| 7.0128566679999995 | 33.902 |
| 7.015917398638889 | 33.886 |
| 7.018980073805556 | 33.879 |
| 7.022040248833334 | 33.902 |
| 7.025100146083333 | 33.902 |
| 7.028173377416667 | 33.894 |
| 7.031236052583334 | 33.894 |
| 7.034295672027778 | 33.894 |
| 7.037358069416666 | 33.902 |
| 7.0404185222499995 | 33.894 |
| 7.043478419472223 | 33.902 |
| 7.046543039194444 | 33.894 |
| 7.04960654775 | 33.894 |
| 7.052667556166667 | 33.902 |
| 7.05573912075 | 33.902 |
| 7.058807351805555 | 33.894 |
| 7.061867249027778 | 33.902 |
| 7.064930757583333 | 33.909 |
| 7.067991488222222 | 33.894 |
| 7.071056107944444 | 33.879 |
| 7.074127950305556 | 33.917 |
| 7.0771881253333335 | 33.902 |
| 7.080249133750001 | 33.917 |
| 7.083308753194444 | 33.925 |
| 7.086368928222223 | 33.917 |
| 7.08942910325 | 33.894 |
| 7.092490111666667 | 33.925 |
| 7.095563343 | 33.917 |
| 7.098623518027778 | 33.925 |
| 7.101685637638889 | 33.925 |
| 7.104744979277778 | 33.925 |
| 7.107806265472222 | 33.925 |
| 7.110865607138889 | 33.932 |
| 7.113927448916667 | 33.94 |
| 7.116987346166666 | 33.917 |
| 7.120048354583333 | 33.925 |
| 7.123109363 | 33.94 |
| 7.126168982444444 | 33.925 |
| 7.129230824222223 | 33.932 |
| 7.132290165888889 | 33.925 |
| 7.135352007666667 | 33.948 |
| 7.138412182722223 | 33.94 |
| 7.141475969055556 | 33.925 |
| 7.144535866305556 | 33.948 |
| 7.147601597194445 | 33.925 |
| 7.150664827972222 | 33.948 |
| 7.153723891833334 | 33.94 |
| 7.1567851780277785 | 33.94 |
| 7.159846186444444 | 33.955 |
| 7.162906083666667 | 33.94 |
| 7.165969036638889 | 33.94 |
| 7.169031156222222 | 33.955 |
| 7.172094664805555 | 33.963 |
| 7.175155395416667 | 33.963 |
| 7.178214737055556 | 33.955 |
| 7.18127741225 | 33.955 |
| 7.184338420638889 | 33.963 |
| 7.187398317888889 | 33.955 |
| 7.190457937333333 | 33.948 |
| 7.193519223527778 | 33.97 |
| 7.19658050975 | 33.955 |
| 7.199640129194444 | 33.955 |
| 7.202701693194444 | 33.963 |
| 7.2057615904166665 | 33.955 |
| 7.208836488527778 | 33.955 |
| 7.211898330333334 | 33.948 |
| 7.214960449916667 | 33.963 |
| 7.218019791555556 | 33.955 |
| 7.221079411 | 33.963 |
| 7.224139030444444 | 33.986 |
| 7.227204483555556 | 33.963 |
| 7.230273825777777 | 33.97 |
| 7.233335945361111 | 33.978 |
| 7.23639834275 | 33.97 |
| 7.239457962194445 | 33.978 |
| 7.242517303861111 | 33.97 |
| 7.245576923305555 | 33.993 |
| 7.248637376111111 | 33.963 |
| 7.251698940111112 | 33.978 |
| 7.2547596707499995 | 33.963 |
| 7.257820123555555 | 33.963 |
| 7.260879743 | 33.963 |
| 7.263942695972223 | 33.955 |
| 7.267003426583333 | 33.97 |
| 7.270065823972222 | 33.97 |
| 7.273125721222223 | 33.963 |
| 7.276187285222222 | 33.963 |
| 7.279248015833334 | 33.97 |
| 7.282310135416667 | 33.97 |
| 7.28537058825 | 33.97 |
| 7.2884327078333335 | 33.97 |
| 7.291496771972223 | 33.986 |
| 7.294558335972222 | 33.97 |
| 7.297619344388889 | 33.97 |
| 7.300681741777778 | 33.986 |
| 7.3037419168055555 | 33.978 |
| 7.306802369638889 | 33.963 |
| 7.309870322888889 | 33.97 |
| 7.312935498194444 | 33.963 |
| 7.315996784416667 | 33.955 |
| 7.319056959444445 | 33.963 |
| 7.322126023861111 | 33.963 |
| 7.325189254638889 | 33.963 |
| 7.328250263055556 | 33.948 |
| 7.331310715861111 | 33.955 |
| 7.334370057527778 | 33.963 |
| 7.337431343722222 | 33.948 |
| 7.340513186666667 | 33.963 |
| 7.343573917277778 | 33.94 |
| 7.346641037166666 | 33.94 |
| 7.349701767777778 | 33.94 |
| 7.352762220611111 | 33.948 |
| 7.355823784611111 | 33.948 |
| 7.358886459777778 | 33.948 |
| 7.3619483015833325 | 33.948 |
| 7.365009587777777 | 33.948 |
| 7.368071985166667 | 33.963 |
| 7.371131049027778 | 33.948 |
| 7.374206502694444 | 33.94 |
| 7.3772775116944445 | 33.948 |
| 7.380337408916667 | 33.94 |
| 7.383396472777777 | 33.963 |
| 7.386455814444445 | 33.94 |
| 7.389515433888889 | 33.948 |
| 7.392575886694445 | 33.94 |
| 7.395639673055556 | 33.955 |
| 7.398702903833334 | 33.948 |
| 7.401763078861111 | 33.955 |
| 7.404824642861111 | 33.948 |
| 7.407885095666667 | 33.97 |
| 7.410944715111111 | 33.955 |
| 7.414004056777778 | 33.955 |
| 7.417064787388889 | 33.948 |
| 7.420126629194445 | 33.963 |
| 7.423186526416666 | 33.948 |
| 7.426247534833333 | 33.955 |
| 7.429307154277778 | 33.948 |
| 7.432379274444444 | 33.97 |
| 7.435438616083333 | 33.94 |
| 7.438499902305556 | 33.963 |
| 7.441570355694444 | 33.97 |
| 7.444633308666667 | 33.97 |
| 7.447694317083333 | 33.978 |
| 7.450753380944444 | 33.97 |
| 7.453813833750001 | 33.97 |
| 7.456874286583334 | 33.97 |
| 7.459935017194445 | 33.978 |
| 7.462994081055555 | 33.97 |
| 7.4660556450555555 | 33.97 |
| 7.469131376555556 | 33.978 |
| 7.472204607888889 | 33.97 |
| 7.475265060694444 | 33.97 |
| 7.4783255135277775 | 33.978 |
| 7.481389855472222 | 33.97 |
| 7.4844489193333334 | 33.986 |
| 7.487509927722223 | 33.963 |
| 7.490577603194445 | 33.978 |
| 7.493641667333334 | 33.978 |
| 7.496704898111111 | 33.986 |
| 7.499765628722222 | 33.978 |
| 7.502825248166667 | 33.993 |
| 7.505887089972223 | 33.978 |
| 7.508949765138889 | 33.986 |
| 7.512009106777778 | 33.978 |
| 7.515069559611111 | 33.993 |
| 7.518132512583334 | 34.001 |
| 7.521192132027777 | 33.993 |
| 7.524252307055556 | 34.009 |
| 7.527319149138889 | 33.986 |
| 7.53037987975 | 34.001 |
| 7.533442277138889 | 34.001 |
| 7.536508008055556 | 34.001 |
| 7.539573738944445 | 34.009 |
| 7.542633080611111 | 33.97 |
| 7.545693533416667 | 34.001 |
| 7.548754264055555 | 34.001 |
| 7.551814716861111 | 34.009 |
| 7.554874614111111 | 34.016 |
| 7.557935344722223 | 34.001 |
| 7.560995797555556 | 34.001 |
| 7.564055972583334 | 34.009 |
| 7.56711614761111 | 34.016 |
| 7.570175767055556 | 34.001 |
| 7.573237608861111 | 34.016 |
| 7.576309173416666 | 34.016 |
| 7.57936962625 | 34.009 |
| 7.582428967916667 | 34.016 |
| 7.585488309555556 | 34.009 |
| 7.5885520959166675 | 34.031 |
| 7.591613104305555 | 34.031 |
| 7.5946738349444445 | 34.024 |
| 7.597736510111111 | 34.024 |
| 7.600798074111111 | 34.039 |
| 7.60385824913889 | 34.031 |
| 7.606918701972223 | 34.031 |
| 7.6099783214166665 | 34.024 |
| 7.613041829972222 | 34.031 |
| 7.616102838388889 | 34.054 |
| 7.619170791638888 | 34.047 |
| 7.622230133277777 | 34.031 |
| 7.625290863916667 | 34.047 |
| 7.628353816888889 | 34.054 |
| 7.631413991916667 | 34.047 |
| 7.634474444722223 | 34.054 |
| 7.637546842694444 | 34.054 |
| 7.640610351249999 | 34.054 |
| 7.6436713596666666 | 34.054 |
| 7.646730701305556 | 34.047 |
| 7.649791431916666 | 34.062 |
| 7.652850495777778 | 34.054 |
| 7.655910948611111 | 34.054 |
| 7.658973068194444 | 34.054 |
| 7.662037132333333 | 34.077 |
| 7.66509814075 | 34.07 |
| 7.668157760194444 | 34.07 |
| 7.671217657444444 | 34.077 |
| 7.6742797770277775 | 34.07 |
| 7.677339118666667 | 34.07 |
| 7.680404016194444 | 34.077 |
| 7.683478914305556 | 34.085 |
| 7.686538255944445 | 34.077 |
| 7.689599819944444 | 34.1 |
| 7.692663328499999 | 34.077 |
| 7.695727392638888 | 34.085 |
| 7.69878951225 | 34.092 |
| 7.701849965055556 | 34.077 |
| 7.704910695694444 | 34.085 |
| 7.707971426305556 | 34.1 |
| 7.711031323527778 | 34.092 |
| 7.714091220777778 | 34.092 |
| 7.717150562416667 | 34.077 |
| 7.720210737472223 | 34.1 |
| 7.723273134833334 | 34.1 |
| 7.726333032083333 | 34.108 |
| 7.7293937626944444 | 34.108 |
| 7.732454493305555 | 34.1 |
| 7.735520502027778 | 34.1 |
| 7.738580677055556 | 34.1 |
| 7.741671409388889 | 34.115 |
| 7.744743807333333 | 34.108 |
| 7.747803982361111 | 34.108 |
| 7.7508636018055554 | 34.123 |
| 7.753927110361111 | 34.108 |
| 7.7569870076111105 | 34.115 |
| 7.760046627055556 | 34.108 |
| 7.763107079888889 | 34.108 |
| 7.766166977111111 | 34.115 |
| 7.769230763472222 | 34.108 |
| 7.772293994222222 | 34.092 |
| 7.775357780583334 | 34.108 |
| 7.7784243448611115 | 34.108 |
| 7.781495353861111 | 34.1 |
| 7.784554973305556 | 34.092 |
| 7.787619593027777 | 34.1 |
| 7.7906789346666665 | 34.115 |
| 7.793741887638889 | 34.115 |
| 7.796806785166667 | 34.1 |
| 7.79986890475 | 34.1 |
| 7.802928801999999 | 34.1 |
| 7.805991754972222 | 34.092 |
| 7.809051652194444 | 34.092 |
| 7.812111549444445 | 34.1 |
| 7.815182002833333 | 34.092 |
| 7.818244678027778 | 34.092 |
| 7.821304575249999 | 34.092 |
| 7.8243914184722225 | 34.092 |
| 7.8274543714444444 | 34.085 |
| 7.830515657638889 | 34.092 |
| 7.833579444000001 | 34.077 |
| 7.836639063444444 | 34.1 |
| 7.839702849805556 | 34.092 |
| 7.842765524972222 | 34.108 |
| 7.845826255583334 | 34.092 |
| 7.848893931055556 | 34.085 |
| 7.851955772833334 | 34.077 |
| 7.855015392277777 | 34.07 |
| 7.858076956277778 | 34.07 |
| 7.861143242777778 | 34.062 |
| 7.864202862222222 | 34.07 |
| 7.867262481666667 | 34.07 |
| 7.870324323472222 | 34.07 |
| 7.873383942916667 | 34.07 |
| 7.876443284555556 | 34.062 |
| 7.879503459583334 | 34.062 |
| 7.882564468000001 | 34.062 |
| 7.88562436525 | 34.07 |
| 7.88868592925 | 34.054 |
| 7.891748326638889 | 34.054 |
| 7.894808501666667 | 34.054 |
| 7.897868121111111 | 34.062 |
| 7.90092746275 | 34.062 |
| 7.903987637777778 | 34.054 |
| 7.907047812805556 | 34.054 |
| 7.91010743225 | 34.047 |
| 7.913170940805555 | 34.047 |
| 7.916231115861111 | 34.054 |
| 7.919293513222223 | 34.062 |
| 7.922353688277778 | 34.031 |
| 7.925419141388889 | 34.054 |
| 7.92848153875 | 34.07 |
| 7.931540880416667 | 34.062 |
| 7.934602444416667 | 34.054 |
| 7.937664008416666 | 34.062 |
| 7.940724183444445 | 34.077 |
| 7.9437843584722225 | 34.047 |
| 7.9468445335 | 34.062 |
| 7.949905819722223 | 34.07 |
| 7.952965161361111 | 34.039 |
| 7.9560264475833335 | 34.054 |
| 7.959089956138889 | 34.062 |
| 7.962149297777778 | 34.062 |
| 7.9652164176388895 | 34.062 |
| 7.968277703861111 | 34.062 |
| 7.971338712277778 | 34.062 |
| 7.974427500055556 | 34.07 |
| 7.9774893418333335 | 34.054 |
| 7.980554239361112 | 34.07 |
| 7.983617470138889 | 34.062 |
| 7.986677367361111 | 34.07 |
| 7.989746431805556 | 34.054 |
| 7.992807162416667 | 34.07 |
| 7.995886505222223 | 34.062 |
| 7.998949180388888 | 34.07 |
| 8.002008799833334 | 34.062 |